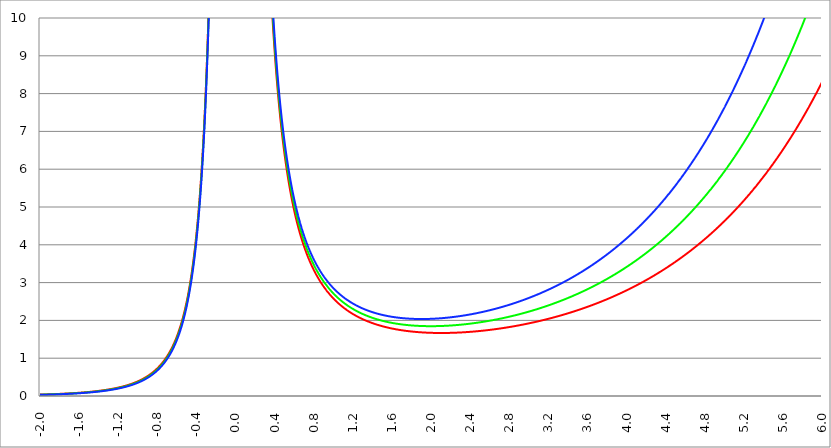
| Category | Series 1 | Series 0 | Series 2 |
|---|---|---|---|
| -2.0 | 0.037 | 0.034 | 0.031 |
| -1.996 | 0.038 | 0.034 | 0.031 |
| -1.992 | 0.038 | 0.034 | 0.031 |
| -1.988 | 0.038 | 0.035 | 0.031 |
| -1.984 | 0.039 | 0.035 | 0.032 |
| -1.98 | 0.039 | 0.035 | 0.032 |
| -1.976 | 0.039 | 0.036 | 0.032 |
| -1.972 | 0.039 | 0.036 | 0.032 |
| -1.968 | 0.04 | 0.036 | 0.033 |
| -1.964 | 0.04 | 0.036 | 0.033 |
| -1.96 | 0.04 | 0.037 | 0.033 |
| -1.956 | 0.041 | 0.037 | 0.034 |
| -1.952 | 0.041 | 0.037 | 0.034 |
| -1.948 | 0.041 | 0.038 | 0.034 |
| -1.944 | 0.042 | 0.038 | 0.034 |
| -1.94 | 0.042 | 0.038 | 0.035 |
| -1.936 | 0.042 | 0.038 | 0.035 |
| -1.932 | 0.043 | 0.039 | 0.035 |
| -1.928 | 0.043 | 0.039 | 0.036 |
| -1.924 | 0.043 | 0.039 | 0.036 |
| -1.92 | 0.044 | 0.04 | 0.036 |
| -1.916 | 0.044 | 0.04 | 0.036 |
| -1.912 | 0.044 | 0.04 | 0.037 |
| -1.908 | 0.045 | 0.041 | 0.037 |
| -1.904 | 0.045 | 0.041 | 0.037 |
| -1.9 | 0.046 | 0.041 | 0.038 |
| -1.896 | 0.046 | 0.042 | 0.038 |
| -1.892 | 0.046 | 0.042 | 0.038 |
| -1.888 | 0.047 | 0.042 | 0.039 |
| -1.884 | 0.047 | 0.043 | 0.039 |
| -1.88 | 0.047 | 0.043 | 0.039 |
| -1.876 | 0.048 | 0.044 | 0.04 |
| -1.872 | 0.048 | 0.044 | 0.04 |
| -1.868 | 0.049 | 0.044 | 0.04 |
| -1.864 | 0.049 | 0.045 | 0.041 |
| -1.86 | 0.049 | 0.045 | 0.041 |
| -1.856 | 0.05 | 0.045 | 0.041 |
| -1.852 | 0.05 | 0.046 | 0.042 |
| -1.848 | 0.051 | 0.046 | 0.042 |
| -1.844 | 0.051 | 0.047 | 0.042 |
| -1.84 | 0.051 | 0.047 | 0.043 |
| -1.836 | 0.052 | 0.047 | 0.043 |
| -1.832 | 0.052 | 0.048 | 0.044 |
| -1.828 | 0.053 | 0.048 | 0.044 |
| -1.824 | 0.053 | 0.049 | 0.044 |
| -1.82 | 0.054 | 0.049 | 0.045 |
| -1.816 | 0.054 | 0.049 | 0.045 |
| -1.812 | 0.054 | 0.05 | 0.045 |
| -1.808 | 0.055 | 0.05 | 0.046 |
| -1.804 | 0.055 | 0.051 | 0.046 |
| -1.8 | 0.056 | 0.051 | 0.047 |
| -1.796 | 0.056 | 0.051 | 0.047 |
| -1.792 | 0.057 | 0.052 | 0.047 |
| -1.788 | 0.057 | 0.052 | 0.048 |
| -1.784 | 0.058 | 0.053 | 0.048 |
| -1.78 | 0.058 | 0.053 | 0.049 |
| -1.776 | 0.059 | 0.054 | 0.049 |
| -1.772 | 0.059 | 0.054 | 0.05 |
| -1.768 | 0.06 | 0.055 | 0.05 |
| -1.764 | 0.06 | 0.055 | 0.05 |
| -1.76 | 0.061 | 0.056 | 0.051 |
| -1.756 | 0.061 | 0.056 | 0.051 |
| -1.752 | 0.062 | 0.056 | 0.052 |
| -1.748 | 0.062 | 0.057 | 0.052 |
| -1.744 | 0.063 | 0.057 | 0.053 |
| -1.74 | 0.063 | 0.058 | 0.053 |
| -1.736 | 0.064 | 0.058 | 0.054 |
| -1.732 | 0.064 | 0.059 | 0.054 |
| -1.728 | 0.065 | 0.059 | 0.055 |
| -1.724 | 0.065 | 0.06 | 0.055 |
| -1.72 | 0.066 | 0.061 | 0.056 |
| -1.716 | 0.067 | 0.061 | 0.056 |
| -1.712 | 0.067 | 0.062 | 0.057 |
| -1.708 | 0.068 | 0.062 | 0.057 |
| -1.704 | 0.068 | 0.063 | 0.058 |
| -1.7 | 0.069 | 0.063 | 0.058 |
| -1.696 | 0.069 | 0.064 | 0.059 |
| -1.692 | 0.07 | 0.064 | 0.059 |
| -1.688 | 0.071 | 0.065 | 0.06 |
| -1.684 | 0.071 | 0.065 | 0.06 |
| -1.68 | 0.072 | 0.066 | 0.061 |
| -1.676 | 0.072 | 0.067 | 0.061 |
| -1.672 | 0.073 | 0.067 | 0.062 |
| -1.668 | 0.074 | 0.068 | 0.062 |
| -1.664 | 0.074 | 0.068 | 0.063 |
| -1.66 | 0.075 | 0.069 | 0.064 |
| -1.656 | 0.076 | 0.07 | 0.064 |
| -1.652 | 0.076 | 0.07 | 0.065 |
| -1.648 | 0.077 | 0.071 | 0.065 |
| -1.644 | 0.078 | 0.071 | 0.066 |
| -1.64 | 0.078 | 0.072 | 0.066 |
| -1.636 | 0.079 | 0.073 | 0.067 |
| -1.632 | 0.08 | 0.073 | 0.068 |
| -1.628 | 0.08 | 0.074 | 0.068 |
| -1.624 | 0.081 | 0.075 | 0.069 |
| -1.62 | 0.082 | 0.075 | 0.07 |
| -1.616 | 0.082 | 0.076 | 0.07 |
| -1.612 | 0.083 | 0.077 | 0.071 |
| -1.608 | 0.084 | 0.077 | 0.071 |
| -1.604 | 0.085 | 0.078 | 0.072 |
| -1.6 | 0.085 | 0.079 | 0.073 |
| -1.596 | 0.086 | 0.08 | 0.073 |
| -1.592 | 0.087 | 0.08 | 0.074 |
| -1.588 | 0.088 | 0.081 | 0.075 |
| -1.584 | 0.089 | 0.082 | 0.076 |
| -1.58 | 0.089 | 0.083 | 0.076 |
| -1.576 | 0.09 | 0.083 | 0.077 |
| -1.572 | 0.091 | 0.084 | 0.078 |
| -1.568 | 0.092 | 0.085 | 0.078 |
| -1.564 | 0.093 | 0.086 | 0.079 |
| -1.56 | 0.093 | 0.086 | 0.08 |
| -1.556 | 0.094 | 0.087 | 0.081 |
| -1.552 | 0.095 | 0.088 | 0.081 |
| -1.548 | 0.096 | 0.089 | 0.082 |
| -1.544 | 0.097 | 0.09 | 0.083 |
| -1.54 | 0.098 | 0.09 | 0.084 |
| -1.536 | 0.099 | 0.091 | 0.084 |
| -1.532 | 0.099 | 0.092 | 0.085 |
| -1.528 | 0.1 | 0.093 | 0.086 |
| -1.524 | 0.101 | 0.094 | 0.087 |
| -1.52 | 0.102 | 0.095 | 0.088 |
| -1.516 | 0.103 | 0.096 | 0.089 |
| -1.512 | 0.104 | 0.096 | 0.089 |
| -1.508 | 0.105 | 0.097 | 0.09 |
| -1.504 | 0.106 | 0.098 | 0.091 |
| -1.5 | 0.107 | 0.099 | 0.092 |
| -1.496 | 0.108 | 0.1 | 0.093 |
| -1.492 | 0.109 | 0.101 | 0.094 |
| -1.488 | 0.11 | 0.102 | 0.095 |
| -1.484 | 0.111 | 0.103 | 0.096 |
| -1.48 | 0.112 | 0.104 | 0.097 |
| -1.476 | 0.113 | 0.105 | 0.097 |
| -1.472 | 0.114 | 0.106 | 0.098 |
| -1.467999999999999 | 0.115 | 0.107 | 0.099 |
| -1.463999999999999 | 0.116 | 0.108 | 0.1 |
| -1.459999999999999 | 0.117 | 0.109 | 0.101 |
| -1.455999999999999 | 0.118 | 0.11 | 0.102 |
| -1.451999999999999 | 0.119 | 0.111 | 0.103 |
| -1.447999999999999 | 0.121 | 0.112 | 0.104 |
| -1.443999999999999 | 0.122 | 0.113 | 0.105 |
| -1.439999999999999 | 0.123 | 0.114 | 0.106 |
| -1.435999999999999 | 0.124 | 0.115 | 0.107 |
| -1.431999999999999 | 0.125 | 0.116 | 0.108 |
| -1.427999999999999 | 0.126 | 0.118 | 0.109 |
| -1.423999999999999 | 0.127 | 0.119 | 0.111 |
| -1.419999999999999 | 0.129 | 0.12 | 0.112 |
| -1.415999999999999 | 0.13 | 0.121 | 0.113 |
| -1.411999999999999 | 0.131 | 0.122 | 0.114 |
| -1.407999999999999 | 0.132 | 0.123 | 0.115 |
| -1.403999999999999 | 0.134 | 0.125 | 0.116 |
| -1.399999999999999 | 0.135 | 0.126 | 0.117 |
| -1.395999999999999 | 0.136 | 0.127 | 0.118 |
| -1.391999999999999 | 0.138 | 0.128 | 0.12 |
| -1.387999999999999 | 0.139 | 0.13 | 0.121 |
| -1.383999999999999 | 0.14 | 0.131 | 0.122 |
| -1.379999999999999 | 0.142 | 0.132 | 0.123 |
| -1.375999999999999 | 0.143 | 0.133 | 0.125 |
| -1.371999999999999 | 0.144 | 0.135 | 0.126 |
| -1.367999999999999 | 0.146 | 0.136 | 0.127 |
| -1.363999999999999 | 0.147 | 0.137 | 0.128 |
| -1.359999999999999 | 0.149 | 0.139 | 0.13 |
| -1.355999999999999 | 0.15 | 0.14 | 0.131 |
| -1.351999999999999 | 0.151 | 0.142 | 0.132 |
| -1.347999999999999 | 0.153 | 0.143 | 0.134 |
| -1.343999999999999 | 0.154 | 0.144 | 0.135 |
| -1.339999999999999 | 0.156 | 0.146 | 0.136 |
| -1.335999999999999 | 0.157 | 0.147 | 0.138 |
| -1.331999999999999 | 0.159 | 0.149 | 0.139 |
| -1.327999999999999 | 0.161 | 0.15 | 0.141 |
| -1.323999999999999 | 0.162 | 0.152 | 0.142 |
| -1.319999999999999 | 0.164 | 0.153 | 0.144 |
| -1.315999999999999 | 0.165 | 0.155 | 0.145 |
| -1.311999999999999 | 0.167 | 0.156 | 0.147 |
| -1.307999999999999 | 0.169 | 0.158 | 0.148 |
| -1.303999999999999 | 0.17 | 0.16 | 0.15 |
| -1.299999999999999 | 0.172 | 0.161 | 0.151 |
| -1.295999999999999 | 0.174 | 0.163 | 0.153 |
| -1.291999999999999 | 0.176 | 0.165 | 0.154 |
| -1.287999999999999 | 0.177 | 0.166 | 0.156 |
| -1.283999999999999 | 0.179 | 0.168 | 0.158 |
| -1.279999999999999 | 0.181 | 0.17 | 0.159 |
| -1.275999999999999 | 0.183 | 0.171 | 0.161 |
| -1.271999999999999 | 0.185 | 0.173 | 0.163 |
| -1.267999999999999 | 0.186 | 0.175 | 0.164 |
| -1.263999999999999 | 0.188 | 0.177 | 0.166 |
| -1.259999999999999 | 0.19 | 0.179 | 0.168 |
| -1.255999999999999 | 0.192 | 0.181 | 0.17 |
| -1.251999999999999 | 0.194 | 0.182 | 0.171 |
| -1.247999999999999 | 0.196 | 0.184 | 0.173 |
| -1.243999999999999 | 0.198 | 0.186 | 0.175 |
| -1.239999999999999 | 0.2 | 0.188 | 0.177 |
| -1.235999999999999 | 0.202 | 0.19 | 0.179 |
| -1.231999999999999 | 0.204 | 0.192 | 0.181 |
| -1.227999999999999 | 0.207 | 0.194 | 0.183 |
| -1.223999999999999 | 0.209 | 0.196 | 0.185 |
| -1.219999999999999 | 0.211 | 0.198 | 0.187 |
| -1.215999999999999 | 0.213 | 0.2 | 0.189 |
| -1.211999999999999 | 0.215 | 0.203 | 0.191 |
| -1.207999999999999 | 0.218 | 0.205 | 0.193 |
| -1.203999999999999 | 0.22 | 0.207 | 0.195 |
| -1.199999999999999 | 0.222 | 0.209 | 0.197 |
| -1.195999999999999 | 0.224 | 0.211 | 0.199 |
| -1.191999999999999 | 0.227 | 0.214 | 0.201 |
| -1.187999999999999 | 0.229 | 0.216 | 0.204 |
| -1.183999999999999 | 0.232 | 0.218 | 0.206 |
| -1.179999999999999 | 0.234 | 0.221 | 0.208 |
| -1.175999999999999 | 0.237 | 0.223 | 0.21 |
| -1.171999999999999 | 0.239 | 0.226 | 0.213 |
| -1.167999999999999 | 0.242 | 0.228 | 0.215 |
| -1.163999999999999 | 0.244 | 0.23 | 0.217 |
| -1.159999999999999 | 0.247 | 0.233 | 0.22 |
| -1.155999999999999 | 0.25 | 0.236 | 0.222 |
| -1.151999999999999 | 0.252 | 0.238 | 0.225 |
| -1.147999999999999 | 0.255 | 0.241 | 0.227 |
| -1.143999999999999 | 0.258 | 0.243 | 0.23 |
| -1.139999999999999 | 0.261 | 0.246 | 0.232 |
| -1.135999999999999 | 0.263 | 0.249 | 0.235 |
| -1.131999999999999 | 0.266 | 0.252 | 0.238 |
| -1.127999999999999 | 0.269 | 0.254 | 0.24 |
| -1.123999999999999 | 0.272 | 0.257 | 0.243 |
| -1.119999999999999 | 0.275 | 0.26 | 0.246 |
| -1.115999999999999 | 0.278 | 0.263 | 0.249 |
| -1.111999999999999 | 0.281 | 0.266 | 0.252 |
| -1.107999999999999 | 0.284 | 0.269 | 0.254 |
| -1.103999999999999 | 0.287 | 0.272 | 0.257 |
| -1.099999999999999 | 0.291 | 0.275 | 0.26 |
| -1.095999999999999 | 0.294 | 0.278 | 0.263 |
| -1.091999999999999 | 0.297 | 0.281 | 0.266 |
| -1.087999999999999 | 0.301 | 0.285 | 0.27 |
| -1.083999999999999 | 0.304 | 0.288 | 0.273 |
| -1.079999999999999 | 0.307 | 0.291 | 0.276 |
| -1.075999999999999 | 0.311 | 0.294 | 0.279 |
| -1.071999999999999 | 0.314 | 0.298 | 0.282 |
| -1.067999999999999 | 0.318 | 0.301 | 0.286 |
| -1.063999999999999 | 0.321 | 0.305 | 0.289 |
| -1.059999999999999 | 0.325 | 0.308 | 0.292 |
| -1.055999999999999 | 0.329 | 0.312 | 0.296 |
| -1.051999999999999 | 0.333 | 0.316 | 0.299 |
| -1.047999999999999 | 0.336 | 0.319 | 0.303 |
| -1.043999999999999 | 0.34 | 0.323 | 0.307 |
| -1.039999999999999 | 0.344 | 0.327 | 0.31 |
| -1.035999999999999 | 0.348 | 0.331 | 0.314 |
| -1.031999999999999 | 0.352 | 0.335 | 0.318 |
| -1.027999999999999 | 0.356 | 0.339 | 0.322 |
| -1.023999999999999 | 0.361 | 0.343 | 0.325 |
| -1.019999999999999 | 0.365 | 0.347 | 0.329 |
| -1.015999999999999 | 0.369 | 0.351 | 0.333 |
| -1.011999999999999 | 0.373 | 0.355 | 0.337 |
| -1.007999999999999 | 0.378 | 0.359 | 0.342 |
| -1.003999999999999 | 0.382 | 0.363 | 0.346 |
| -0.999999999999999 | 0.387 | 0.368 | 0.35 |
| -0.995999999999999 | 0.391 | 0.372 | 0.354 |
| -0.991999999999999 | 0.396 | 0.377 | 0.359 |
| -0.987999999999999 | 0.401 | 0.381 | 0.363 |
| -0.983999999999999 | 0.406 | 0.386 | 0.368 |
| -0.979999999999999 | 0.41 | 0.391 | 0.372 |
| -0.975999999999999 | 0.415 | 0.396 | 0.377 |
| -0.971999999999999 | 0.42 | 0.4 | 0.381 |
| -0.967999999999999 | 0.425 | 0.405 | 0.386 |
| -0.963999999999999 | 0.431 | 0.41 | 0.391 |
| -0.959999999999999 | 0.436 | 0.415 | 0.396 |
| -0.955999999999999 | 0.441 | 0.421 | 0.401 |
| -0.951999999999999 | 0.447 | 0.426 | 0.406 |
| -0.947999999999999 | 0.452 | 0.431 | 0.411 |
| -0.943999999999999 | 0.458 | 0.437 | 0.416 |
| -0.939999999999999 | 0.463 | 0.442 | 0.422 |
| -0.935999999999999 | 0.469 | 0.448 | 0.427 |
| -0.931999999999999 | 0.475 | 0.453 | 0.433 |
| -0.927999999999999 | 0.481 | 0.459 | 0.438 |
| -0.923999999999999 | 0.487 | 0.465 | 0.444 |
| -0.919999999999999 | 0.493 | 0.471 | 0.45 |
| -0.915999999999999 | 0.499 | 0.477 | 0.456 |
| -0.911999999999999 | 0.506 | 0.483 | 0.461 |
| -0.907999999999999 | 0.512 | 0.489 | 0.467 |
| -0.903999999999999 | 0.518 | 0.496 | 0.474 |
| -0.899999999999999 | 0.525 | 0.502 | 0.48 |
| -0.895999999999999 | 0.532 | 0.508 | 0.486 |
| -0.891999999999999 | 0.539 | 0.515 | 0.493 |
| -0.887999999999999 | 0.546 | 0.522 | 0.499 |
| -0.883999999999999 | 0.553 | 0.529 | 0.506 |
| -0.879999999999999 | 0.56 | 0.536 | 0.513 |
| -0.875999999999999 | 0.567 | 0.543 | 0.519 |
| -0.871999999999999 | 0.574 | 0.55 | 0.526 |
| -0.867999999999999 | 0.582 | 0.557 | 0.534 |
| -0.863999999999999 | 0.59 | 0.565 | 0.541 |
| -0.859999999999999 | 0.597 | 0.572 | 0.548 |
| -0.855999999999999 | 0.605 | 0.58 | 0.556 |
| -0.851999999999999 | 0.613 | 0.588 | 0.563 |
| -0.847999999999999 | 0.621 | 0.596 | 0.571 |
| -0.843999999999999 | 0.63 | 0.604 | 0.579 |
| -0.839999999999999 | 0.638 | 0.612 | 0.587 |
| -0.835999999999999 | 0.647 | 0.62 | 0.595 |
| -0.831999999999999 | 0.655 | 0.629 | 0.603 |
| -0.827999999999999 | 0.664 | 0.637 | 0.611 |
| -0.823999999999999 | 0.673 | 0.646 | 0.62 |
| -0.819999999999999 | 0.682 | 0.655 | 0.629 |
| -0.815999999999999 | 0.692 | 0.664 | 0.638 |
| -0.811999999999999 | 0.701 | 0.673 | 0.647 |
| -0.807999999999999 | 0.711 | 0.683 | 0.656 |
| -0.803999999999999 | 0.721 | 0.692 | 0.665 |
| -0.799999999999999 | 0.731 | 0.702 | 0.675 |
| -0.795999999999999 | 0.741 | 0.712 | 0.684 |
| -0.791999999999999 | 0.751 | 0.722 | 0.694 |
| -0.787999999999999 | 0.762 | 0.732 | 0.704 |
| -0.783999999999999 | 0.773 | 0.743 | 0.714 |
| -0.779999999999999 | 0.783 | 0.753 | 0.725 |
| -0.775999999999999 | 0.795 | 0.764 | 0.735 |
| -0.771999999999999 | 0.806 | 0.775 | 0.746 |
| -0.767999999999999 | 0.817 | 0.787 | 0.757 |
| -0.763999999999999 | 0.829 | 0.798 | 0.768 |
| -0.759999999999999 | 0.841 | 0.81 | 0.779 |
| -0.755999999999999 | 0.853 | 0.822 | 0.791 |
| -0.751999999999999 | 0.866 | 0.834 | 0.803 |
| -0.747999999999999 | 0.878 | 0.846 | 0.815 |
| -0.743999999999999 | 0.891 | 0.858 | 0.827 |
| -0.739999999999999 | 0.904 | 0.871 | 0.84 |
| -0.735999999999999 | 0.917 | 0.884 | 0.852 |
| -0.731999999999999 | 0.931 | 0.898 | 0.865 |
| -0.727999999999999 | 0.945 | 0.911 | 0.879 |
| -0.723999999999999 | 0.959 | 0.925 | 0.892 |
| -0.719999999999999 | 0.973 | 0.939 | 0.906 |
| -0.715999999999999 | 0.988 | 0.953 | 0.92 |
| -0.711999999999999 | 1.003 | 0.968 | 0.934 |
| -0.707999999999999 | 1.018 | 0.983 | 0.949 |
| -0.703999999999999 | 1.034 | 0.998 | 0.963 |
| -0.699999999999999 | 1.05 | 1.013 | 0.979 |
| -0.695999999999999 | 1.066 | 1.029 | 0.994 |
| -0.691999999999999 | 1.082 | 1.045 | 1.01 |
| -0.687999999999999 | 1.099 | 1.062 | 1.026 |
| -0.683999999999999 | 1.116 | 1.079 | 1.042 |
| -0.679999999999999 | 1.134 | 1.096 | 1.059 |
| -0.675999999999999 | 1.151 | 1.113 | 1.076 |
| -0.671999999999999 | 1.17 | 1.131 | 1.094 |
| -0.667999999999999 | 1.188 | 1.149 | 1.111 |
| -0.663999999999999 | 1.207 | 1.168 | 1.129 |
| -0.659999999999999 | 1.226 | 1.187 | 1.148 |
| -0.655999999999999 | 1.246 | 1.206 | 1.167 |
| -0.651999999999999 | 1.266 | 1.226 | 1.186 |
| -0.647999999999999 | 1.287 | 1.246 | 1.206 |
| -0.643999999999999 | 1.308 | 1.266 | 1.226 |
| -0.639999999999999 | 1.329 | 1.287 | 1.247 |
| -0.635999999999999 | 1.351 | 1.309 | 1.268 |
| -0.631999999999999 | 1.373 | 1.331 | 1.289 |
| -0.627999999999999 | 1.396 | 1.353 | 1.311 |
| -0.623999999999999 | 1.42 | 1.376 | 1.334 |
| -0.619999999999999 | 1.444 | 1.399 | 1.357 |
| -0.615999999999999 | 1.468 | 1.423 | 1.38 |
| -0.611999999999999 | 1.493 | 1.448 | 1.404 |
| -0.607999999999999 | 1.518 | 1.473 | 1.429 |
| -0.603999999999999 | 1.544 | 1.498 | 1.454 |
| -0.599999999999999 | 1.571 | 1.524 | 1.479 |
| -0.595999999999999 | 1.598 | 1.551 | 1.506 |
| -0.591999999999999 | 1.626 | 1.579 | 1.532 |
| -0.587999999999999 | 1.654 | 1.606 | 1.56 |
| -0.583999999999999 | 1.684 | 1.635 | 1.588 |
| -0.579999999999999 | 1.713 | 1.664 | 1.617 |
| -0.575999999999999 | 1.744 | 1.694 | 1.646 |
| -0.571999999999999 | 1.775 | 1.725 | 1.676 |
| -0.567999999999999 | 1.807 | 1.756 | 1.707 |
| -0.563999999999999 | 1.84 | 1.789 | 1.739 |
| -0.559999999999999 | 1.873 | 1.821 | 1.771 |
| -0.555999999999999 | 1.907 | 1.855 | 1.804 |
| -0.551999999999999 | 1.943 | 1.89 | 1.838 |
| -0.547999999999999 | 1.979 | 1.925 | 1.873 |
| -0.543999999999999 | 2.015 | 1.961 | 1.909 |
| -0.539999999999999 | 2.053 | 1.998 | 1.945 |
| -0.535999999999999 | 2.092 | 2.037 | 1.983 |
| -0.531999999999999 | 2.131 | 2.076 | 2.021 |
| -0.527999999999999 | 2.172 | 2.116 | 2.06 |
| -0.523999999999999 | 2.214 | 2.157 | 2.101 |
| -0.519999999999999 | 2.257 | 2.199 | 2.142 |
| -0.515999999999999 | 2.3 | 2.242 | 2.185 |
| -0.511999999999999 | 2.345 | 2.286 | 2.228 |
| -0.507999999999999 | 2.392 | 2.332 | 2.273 |
| -0.503999999999999 | 2.439 | 2.378 | 2.319 |
| -0.499999999999999 | 2.488 | 2.426 | 2.366 |
| -0.495999999999999 | 2.537 | 2.475 | 2.415 |
| -0.491999999999999 | 2.589 | 2.526 | 2.464 |
| -0.487999999999999 | 2.641 | 2.578 | 2.516 |
| -0.483999999999999 | 2.695 | 2.631 | 2.568 |
| -0.479999999999999 | 2.751 | 2.686 | 2.622 |
| -0.475999999999999 | 2.808 | 2.742 | 2.677 |
| -0.471999999999999 | 2.867 | 2.8 | 2.735 |
| -0.467999999999999 | 2.927 | 2.859 | 2.793 |
| -0.463999999999999 | 2.989 | 2.92 | 2.853 |
| -0.459999999999999 | 3.053 | 2.983 | 2.916 |
| -0.455999999999999 | 3.118 | 3.048 | 2.979 |
| -0.451999999999999 | 3.186 | 3.115 | 3.045 |
| -0.447999999999999 | 3.255 | 3.183 | 3.113 |
| -0.443999999999999 | 3.327 | 3.254 | 3.182 |
| -0.439999999999999 | 3.401 | 3.327 | 3.254 |
| -0.435999999999999 | 3.477 | 3.402 | 3.328 |
| -0.431999999999999 | 3.555 | 3.479 | 3.404 |
| -0.427999999999999 | 3.635 | 3.558 | 3.483 |
| -0.423999999999999 | 3.718 | 3.64 | 3.564 |
| -0.419999999999999 | 3.804 | 3.725 | 3.647 |
| -0.415999999999999 | 3.892 | 3.812 | 3.733 |
| -0.411999999999999 | 3.983 | 3.902 | 3.822 |
| -0.407999999999999 | 4.077 | 3.995 | 3.914 |
| -0.403999999999999 | 4.174 | 4.091 | 4.009 |
| -0.399999999999999 | 4.274 | 4.19 | 4.107 |
| -0.395999999999999 | 4.378 | 4.292 | 4.208 |
| -0.391999999999999 | 4.484 | 4.397 | 4.312 |
| -0.387999999999999 | 4.595 | 4.506 | 4.42 |
| -0.383999999999999 | 4.709 | 4.619 | 4.531 |
| -0.379999999999999 | 4.827 | 4.736 | 4.647 |
| -0.375999999999999 | 4.949 | 4.857 | 4.766 |
| -0.371999999999999 | 5.075 | 4.981 | 4.89 |
| -0.367999999999998 | 5.206 | 5.111 | 5.018 |
| -0.363999999999998 | 5.341 | 5.245 | 5.15 |
| -0.359999999999998 | 5.481 | 5.383 | 5.287 |
| -0.355999999999998 | 5.626 | 5.527 | 5.43 |
| -0.351999999999998 | 5.777 | 5.676 | 5.577 |
| -0.347999999999998 | 5.933 | 5.831 | 5.73 |
| -0.343999999999998 | 6.095 | 5.991 | 5.889 |
| -0.339999999999998 | 6.263 | 6.157 | 6.053 |
| -0.335999999999998 | 6.437 | 6.33 | 6.224 |
| -0.331999999999998 | 6.618 | 6.509 | 6.402 |
| -0.327999999999998 | 6.807 | 6.696 | 6.587 |
| -0.323999999999998 | 7.002 | 6.89 | 6.779 |
| -0.319999999999998 | 7.206 | 7.091 | 6.979 |
| -0.315999999999998 | 7.417 | 7.301 | 7.187 |
| -0.311999999999998 | 7.638 | 7.52 | 7.403 |
| -0.307999999999998 | 7.867 | 7.747 | 7.629 |
| -0.303999999999998 | 8.106 | 7.984 | 7.864 |
| -0.299999999999998 | 8.356 | 8.231 | 8.109 |
| -0.295999999999998 | 8.616 | 8.489 | 8.364 |
| -0.291999999999998 | 8.887 | 8.758 | 8.631 |
| -0.287999999999998 | 9.17 | 9.039 | 8.91 |
| -0.283999999999998 | 9.467 | 9.333 | 9.201 |
| -0.279999999999998 | 9.776 | 9.64 | 9.506 |
| -0.275999999999998 | 10.1 | 9.961 | 9.825 |
| -0.271999999999998 | 10.439 | 10.298 | 10.158 |
| -0.267999999999998 | 10.793 | 10.65 | 10.508 |
| -0.263999999999998 | 11.165 | 11.019 | 10.874 |
| -0.259999999999998 | 11.555 | 11.406 | 11.259 |
| -0.255999999999998 | 11.965 | 11.812 | 11.662 |
| -0.251999999999998 | 12.394 | 12.239 | 12.086 |
| -0.247999999999998 | 12.846 | 12.688 | 12.532 |
| -0.243999999999998 | 13.321 | 13.16 | 13 |
| -0.239999999999998 | 13.822 | 13.657 | 13.494 |
| -0.235999999999998 | 14.349 | 14.18 | 14.014 |
| -0.231999999999998 | 14.904 | 14.732 | 14.562 |
| -0.227999999999998 | 15.49 | 15.315 | 15.141 |
| -0.223999999999998 | 16.11 | 15.93 | 15.753 |
| -0.219999999999998 | 16.764 | 16.581 | 16.4 |
| -0.215999999999998 | 17.457 | 17.27 | 17.084 |
| -0.211999999999998 | 18.191 | 17.999 | 17.81 |
| -0.207999999999998 | 18.97 | 18.773 | 18.579 |
| -0.203999999999998 | 19.796 | 19.595 | 19.396 |
| -0.199999999999998 | 20.674 | 20.468 | 20.265 |
| -0.195999999999998 | 21.608 | 21.398 | 21.189 |
| -0.191999999999998 | 22.604 | 22.388 | 22.174 |
| -0.187999999999998 | 23.666 | 23.444 | 23.225 |
| -0.183999999999998 | 24.8 | 24.573 | 24.348 |
| -0.179999999999998 | 26.013 | 25.78 | 25.549 |
| -0.175999999999998 | 27.312 | 27.073 | 26.836 |
| -0.171999999999998 | 28.706 | 28.461 | 28.217 |
| -0.167999999999998 | 30.204 | 29.952 | 29.701 |
| -0.163999999999998 | 31.816 | 31.556 | 31.299 |
| -0.159999999999998 | 33.554 | 33.287 | 33.022 |
| -0.155999999999998 | 35.431 | 35.156 | 34.883 |
| -0.151999999999998 | 37.463 | 37.179 | 36.898 |
| -0.147999999999998 | 39.666 | 39.373 | 39.083 |
| -0.143999999999998 | 42.059 | 41.758 | 41.458 |
| -0.139999999999998 | 44.667 | 44.355 | 44.046 |
| -0.135999999999998 | 47.513 | 47.191 | 46.871 |
| -0.131999999999998 | 50.628 | 50.295 | 49.964 |
| -0.127999999999998 | 54.047 | 53.702 | 53.359 |
| -0.123999999999998 | 57.809 | 57.452 | 57.097 |
| -0.119999999999998 | 61.962 | 61.592 | 61.223 |
| -0.115999999999998 | 66.562 | 66.177 | 65.794 |
| -0.111999999999998 | 71.673 | 71.273 | 70.875 |
| -0.107999999999998 | 77.374 | 76.957 | 76.543 |
| -0.103999999999998 | 83.758 | 83.323 | 82.891 |
| -0.0999999999999983 | 90.937 | 90.484 | 90.032 |
| -0.0959999999999983 | 99.049 | 98.575 | 98.103 |
| -0.0919999999999983 | 108.26 | 107.763 | 107.268 |
| -0.0879999999999983 | 118.776 | 118.254 | 117.735 |
| -0.0839999999999983 | 130.853 | 130.305 | 129.759 |
| -0.0799999999999983 | 144.815 | 144.237 | 143.661 |
| -0.0759999999999983 | 161.071 | 160.46 | 159.851 |
| -0.0719999999999983 | 180.148 | 179.501 | 178.856 |
| -0.0679999999999983 | 202.734 | 202.046 | 201.36 |
| -0.0639999999999983 | 229.739 | 229.005 | 228.273 |
| -0.0599999999999983 | 262.387 | 261.601 | 260.818 |
| -0.0559999999999983 | 302.357 | 301.511 | 300.668 |
| -0.0519999999999983 | 351.997 | 351.083 | 350.172 |
| -0.0479999999999983 | 414.681 | 413.687 | 412.695 |
| -0.0439999999999983 | 495.383 | 494.294 | 493.208 |
| -0.0399999999999983 | 601.696 | 600.493 | 599.294 |
| -0.0359999999999982 | 745.662 | 744.321 | 742.983 |
| -0.0319999999999982 | 947.322 | 945.807 | 944.295 |
| -0.0279999999999982 | 1242.029 | 1240.291 | 1238.556 |
| -0.0239999999999982 | 1696.976 | 1694.94 | 1692.908 |
| -0.0199999999999982 | 2452.948 | 2450.497 | 2448.047 |
| -0.0159999999999982 | 3847.324 | 3844.247 | 3841.173 |
| -0.0119999999999982 | 6865.727 | 6861.609 | 6857.493 |
| -0.00799999999999825 | 15506.7 | 15500.499 | 15494.3 |
| -0.00399999999999825 | 62262.951 | 62250.499 | 62238.05 |
| 1.74860126378462e-15 | 327053216083070977659786756096 | 327053216083070977659786756096 | 327053216083070977659786756096 |
| 0.00400000000000175 | 62737.952 | 62750.501 | 62763.052 |
| 0.00800000000000175 | 15744.202 | 15750.501 | 15756.803 |
| 0.0120000000000017 | 7024.064 | 7028.28 | 7032.498 |
| 0.0160000000000017 | 3966.079 | 3969.253 | 3972.429 |
| 0.0200000000000017 | 2547.954 | 2550.503 | 2553.055 |
| 0.0240000000000017 | 1776.149 | 1778.282 | 1780.417 |
| 0.0280000000000017 | 1309.894 | 1311.729 | 1313.567 |
| 0.0320000000000017 | 1006.706 | 1008.318 | 1009.932 |
| 0.0360000000000017 | 798.45 | 799.889 | 801.33 |
| 0.0400000000000017 | 649.207 | 650.507 | 651.809 |
| 0.0440000000000018 | 538.577 | 539.764 | 540.952 |
| 0.0480000000000018 | 454.278 | 455.369 | 456.463 |
| 0.0520000000000018 | 388.55 | 389.562 | 390.576 |
| 0.0560000000000018 | 336.301 | 337.244 | 338.19 |
| 0.0600000000000018 | 294.071 | 294.955 | 295.841 |
| 0.0640000000000018 | 259.445 | 260.276 | 261.111 |
| 0.0680000000000018 | 230.695 | 231.48 | 232.269 |
| 0.0720000000000018 | 206.557 | 207.302 | 208.05 |
| 0.0760000000000018 | 186.093 | 186.801 | 187.512 |
| 0.0800000000000018 | 168.588 | 169.264 | 169.942 |
| 0.0840000000000018 | 153.496 | 154.142 | 154.791 |
| 0.0880000000000018 | 140.392 | 141.011 | 141.633 |
| 0.0920000000000018 | 128.938 | 129.533 | 130.13 |
| 0.0960000000000018 | 118.868 | 119.44 | 120.015 |
| 0.100000000000002 | 109.966 | 110.517 | 111.071 |
| 0.104000000000002 | 102.057 | 102.589 | 103.124 |
| 0.108000000000002 | 94.997 | 95.512 | 96.029 |
| 0.112000000000002 | 88.669 | 89.167 | 89.668 |
| 0.116000000000002 | 82.974 | 83.457 | 83.942 |
| 0.120000000000002 | 77.83 | 78.298 | 78.77 |
| 0.124000000000002 | 73.167 | 73.622 | 74.08 |
| 0.128000000000002 | 68.927 | 69.37 | 69.815 |
| 0.132000000000002 | 65.06 | 65.491 | 65.924 |
| 0.136000000000002 | 61.522 | 61.942 | 62.365 |
| 0.140000000000002 | 58.278 | 58.687 | 59.1 |
| 0.144000000000002 | 55.295 | 55.695 | 56.097 |
| 0.148000000000002 | 52.546 | 52.936 | 53.329 |
| 0.152000000000002 | 50.006 | 50.388 | 50.772 |
| 0.156000000000002 | 47.656 | 48.029 | 48.405 |
| 0.160000000000002 | 45.475 | 45.84 | 46.208 |
| 0.164000000000002 | 43.449 | 43.806 | 44.167 |
| 0.168000000000002 | 41.562 | 41.912 | 42.266 |
| 0.172000000000002 | 39.802 | 40.146 | 40.493 |
| 0.176000000000002 | 38.158 | 38.496 | 38.836 |
| 0.180000000000002 | 36.62 | 36.951 | 37.285 |
| 0.184000000000002 | 35.179 | 35.504 | 35.832 |
| 0.188000000000002 | 33.826 | 34.145 | 34.468 |
| 0.192000000000002 | 32.555 | 32.869 | 33.186 |
| 0.196000000000002 | 31.358 | 31.667 | 31.979 |
| 0.200000000000002 | 30.231 | 30.535 | 30.842 |
| 0.204000000000002 | 29.168 | 29.467 | 29.769 |
| 0.208000000000002 | 28.164 | 28.458 | 28.756 |
| 0.212000000000002 | 27.214 | 27.504 | 27.797 |
| 0.216000000000002 | 26.315 | 26.601 | 26.89 |
| 0.220000000000002 | 25.464 | 25.745 | 26.03 |
| 0.224000000000002 | 24.656 | 24.934 | 25.214 |
| 0.228000000000002 | 23.889 | 24.163 | 24.44 |
| 0.232000000000002 | 23.16 | 23.43 | 23.704 |
| 0.236000000000002 | 22.467 | 22.734 | 23.004 |
| 0.240000000000002 | 21.807 | 22.07 | 22.337 |
| 0.244000000000002 | 21.178 | 21.438 | 21.701 |
| 0.248000000000002 | 20.579 | 20.835 | 21.095 |
| 0.252000000000002 | 20.006 | 20.26 | 20.517 |
| 0.256000000000002 | 19.46 | 19.711 | 19.964 |
| 0.260000000000002 | 18.938 | 19.185 | 19.436 |
| 0.264000000000002 | 18.438 | 18.683 | 18.931 |
| 0.268000000000002 | 17.96 | 18.202 | 18.448 |
| 0.272000000000002 | 17.502 | 17.741 | 17.984 |
| 0.276000000000002 | 17.063 | 17.3 | 17.54 |
| 0.280000000000002 | 16.642 | 16.877 | 17.115 |
| 0.284000000000002 | 16.238 | 16.47 | 16.706 |
| 0.288000000000002 | 15.85 | 16.08 | 16.313 |
| 0.292000000000002 | 15.478 | 15.705 | 15.936 |
| 0.296000000000002 | 15.12 | 15.345 | 15.574 |
| 0.300000000000002 | 14.775 | 14.998 | 15.225 |
| 0.304000000000002 | 14.444 | 14.665 | 14.889 |
| 0.308000000000002 | 14.125 | 14.344 | 14.566 |
| 0.312000000000002 | 13.817 | 14.034 | 14.255 |
| 0.316000000000002 | 13.521 | 13.736 | 13.955 |
| 0.320000000000002 | 13.235 | 13.449 | 13.665 |
| 0.324000000000002 | 12.959 | 13.171 | 13.386 |
| 0.328000000000002 | 12.693 | 12.903 | 13.117 |
| 0.332000000000002 | 12.437 | 12.645 | 12.856 |
| 0.336000000000002 | 12.188 | 12.395 | 12.605 |
| 0.340000000000002 | 11.949 | 12.154 | 12.362 |
| 0.344000000000002 | 11.717 | 11.92 | 12.127 |
| 0.348000000000002 | 11.493 | 11.694 | 11.9 |
| 0.352000000000002 | 11.276 | 11.476 | 11.68 |
| 0.356000000000002 | 11.066 | 11.264 | 11.467 |
| 0.360000000000002 | 10.862 | 11.06 | 11.261 |
| 0.364000000000002 | 10.665 | 10.861 | 11.061 |
| 0.368000000000002 | 10.475 | 10.669 | 10.867 |
| 0.372000000000002 | 10.289 | 10.483 | 10.679 |
| 0.376000000000002 | 10.11 | 10.302 | 10.497 |
| 0.380000000000002 | 9.936 | 10.127 | 10.321 |
| 0.384000000000002 | 9.767 | 9.956 | 10.15 |
| 0.388000000000002 | 9.603 | 9.791 | 9.983 |
| 0.392000000000002 | 9.444 | 9.631 | 9.822 |
| 0.396000000000002 | 9.289 | 9.475 | 9.665 |
| 0.400000000000002 | 9.139 | 9.324 | 9.512 |
| 0.404000000000002 | 8.993 | 9.177 | 9.364 |
| 0.408000000000002 | 8.851 | 9.034 | 9.22 |
| 0.412000000000002 | 8.713 | 8.895 | 9.08 |
| 0.416000000000002 | 8.579 | 8.76 | 8.944 |
| 0.420000000000002 | 8.449 | 8.628 | 8.811 |
| 0.424000000000002 | 8.322 | 8.5 | 8.682 |
| 0.428000000000002 | 8.198 | 8.375 | 8.556 |
| 0.432000000000002 | 8.077 | 8.254 | 8.434 |
| 0.436000000000002 | 7.96 | 8.135 | 8.315 |
| 0.440000000000002 | 7.846 | 8.02 | 8.199 |
| 0.444000000000002 | 7.734 | 7.908 | 8.085 |
| 0.448000000000002 | 7.626 | 7.798 | 7.975 |
| 0.452000000000002 | 7.52 | 7.692 | 7.868 |
| 0.456000000000002 | 7.417 | 7.588 | 7.763 |
| 0.460000000000002 | 7.316 | 7.486 | 7.66 |
| 0.464000000000002 | 7.218 | 7.387 | 7.561 |
| 0.468000000000002 | 7.122 | 7.291 | 7.463 |
| 0.472000000000002 | 7.028 | 7.196 | 7.368 |
| 0.476000000000002 | 6.937 | 7.104 | 7.275 |
| 0.480000000000002 | 6.848 | 7.014 | 7.185 |
| 0.484000000000002 | 6.761 | 6.926 | 7.096 |
| 0.488000000000002 | 6.676 | 6.841 | 7.01 |
| 0.492000000000002 | 6.593 | 6.757 | 6.925 |
| 0.496000000000002 | 6.511 | 6.675 | 6.843 |
| 0.500000000000002 | 6.432 | 6.595 | 6.762 |
| 0.504000000000002 | 6.354 | 6.517 | 6.683 |
| 0.508000000000002 | 6.279 | 6.44 | 6.606 |
| 0.512000000000002 | 6.204 | 6.365 | 6.53 |
| 0.516000000000002 | 6.132 | 6.292 | 6.457 |
| 0.520000000000002 | 6.061 | 6.221 | 6.384 |
| 0.524000000000002 | 5.991 | 6.15 | 6.314 |
| 0.528000000000002 | 5.923 | 6.082 | 6.245 |
| 0.532000000000002 | 5.857 | 6.015 | 6.177 |
| 0.536000000000002 | 5.792 | 5.949 | 6.111 |
| 0.540000000000002 | 5.728 | 5.885 | 6.046 |
| 0.544000000000002 | 5.666 | 5.822 | 5.982 |
| 0.548000000000002 | 5.604 | 5.76 | 5.92 |
| 0.552000000000002 | 5.545 | 5.7 | 5.859 |
| 0.556000000000002 | 5.486 | 5.641 | 5.8 |
| 0.560000000000002 | 5.428 | 5.583 | 5.741 |
| 0.564000000000002 | 5.372 | 5.526 | 5.684 |
| 0.568000000000002 | 5.317 | 5.47 | 5.628 |
| 0.572000000000002 | 5.263 | 5.415 | 5.572 |
| 0.576000000000002 | 5.21 | 5.362 | 5.518 |
| 0.580000000000002 | 5.158 | 5.309 | 5.465 |
| 0.584000000000002 | 5.106 | 5.258 | 5.414 |
| 0.588000000000002 | 5.056 | 5.207 | 5.363 |
| 0.592000000000002 | 5.007 | 5.158 | 5.313 |
| 0.596000000000002 | 4.959 | 5.109 | 5.264 |
| 0.600000000000002 | 4.912 | 5.061 | 5.216 |
| 0.604000000000002 | 4.865 | 5.015 | 5.168 |
| 0.608000000000002 | 4.82 | 4.969 | 5.122 |
| 0.612000000000002 | 4.775 | 4.924 | 5.077 |
| 0.616000000000002 | 4.731 | 4.879 | 5.032 |
| 0.620000000000002 | 4.688 | 4.836 | 4.988 |
| 0.624000000000002 | 4.646 | 4.793 | 4.945 |
| 0.628000000000002 | 4.604 | 4.751 | 4.903 |
| 0.632000000000002 | 4.564 | 4.71 | 4.861 |
| 0.636000000000002 | 4.524 | 4.67 | 4.821 |
| 0.640000000000002 | 4.484 | 4.63 | 4.781 |
| 0.644000000000002 | 4.446 | 4.591 | 4.741 |
| 0.648000000000002 | 4.408 | 4.553 | 4.703 |
| 0.652000000000002 | 4.37 | 4.515 | 4.665 |
| 0.656000000000002 | 4.334 | 4.478 | 4.627 |
| 0.660000000000002 | 4.297 | 4.442 | 4.591 |
| 0.664000000000002 | 4.262 | 4.406 | 4.555 |
| 0.668000000000002 | 4.227 | 4.371 | 4.519 |
| 0.672000000000002 | 4.193 | 4.336 | 4.484 |
| 0.676000000000002 | 4.159 | 4.302 | 4.45 |
| 0.680000000000002 | 4.126 | 4.269 | 4.416 |
| 0.684000000000002 | 4.093 | 4.236 | 4.383 |
| 0.688000000000002 | 4.061 | 4.204 | 4.351 |
| 0.692000000000002 | 4.03 | 4.172 | 4.319 |
| 0.696000000000002 | 3.999 | 4.14 | 4.287 |
| 0.700000000000002 | 3.968 | 4.11 | 4.256 |
| 0.704000000000002 | 3.938 | 4.079 | 4.226 |
| 0.708000000000002 | 3.909 | 4.05 | 4.196 |
| 0.712000000000002 | 3.88 | 4.02 | 4.166 |
| 0.716000000000002 | 3.851 | 3.991 | 4.137 |
| 0.720000000000002 | 3.823 | 3.963 | 4.108 |
| 0.724000000000002 | 3.795 | 3.935 | 4.08 |
| 0.728000000000002 | 3.768 | 3.908 | 4.052 |
| 0.732000000000002 | 3.741 | 3.88 | 4.025 |
| 0.736000000000002 | 3.715 | 3.854 | 3.998 |
| 0.740000000000002 | 3.688 | 3.827 | 3.972 |
| 0.744000000000002 | 3.663 | 3.802 | 3.946 |
| 0.748000000000002 | 3.638 | 3.776 | 3.92 |
| 0.752000000000002 | 3.613 | 3.751 | 3.895 |
| 0.756000000000002 | 3.588 | 3.726 | 3.87 |
| 0.760000000000002 | 3.564 | 3.702 | 3.845 |
| 0.764000000000002 | 3.54 | 3.678 | 3.821 |
| 0.768000000000002 | 3.517 | 3.654 | 3.797 |
| 0.772000000000002 | 3.494 | 3.631 | 3.774 |
| 0.776000000000002 | 3.471 | 3.608 | 3.751 |
| 0.780000000000002 | 3.448 | 3.586 | 3.728 |
| 0.784000000000002 | 3.426 | 3.563 | 3.706 |
| 0.788000000000002 | 3.405 | 3.541 | 3.684 |
| 0.792000000000002 | 3.383 | 3.52 | 3.662 |
| 0.796000000000002 | 3.362 | 3.498 | 3.64 |
| 0.800000000000002 | 3.341 | 3.477 | 3.619 |
| 0.804000000000002 | 3.32 | 3.457 | 3.598 |
| 0.808000000000002 | 3.3 | 3.436 | 3.578 |
| 0.812000000000002 | 3.28 | 3.416 | 3.558 |
| 0.816000000000002 | 3.261 | 3.396 | 3.538 |
| 0.820000000000002 | 3.241 | 3.377 | 3.518 |
| 0.824000000000002 | 3.222 | 3.357 | 3.499 |
| 0.828000000000002 | 3.203 | 3.338 | 3.479 |
| 0.832000000000002 | 3.184 | 3.32 | 3.461 |
| 0.836000000000002 | 3.166 | 3.301 | 3.442 |
| 0.840000000000002 | 3.148 | 3.283 | 3.424 |
| 0.844000000000002 | 3.13 | 3.265 | 3.406 |
| 0.848000000000002 | 3.112 | 3.247 | 3.388 |
| 0.852000000000002 | 3.095 | 3.23 | 3.37 |
| 0.856000000000002 | 3.078 | 3.212 | 3.353 |
| 0.860000000000002 | 3.061 | 3.195 | 3.336 |
| 0.864000000000002 | 3.044 | 3.178 | 3.319 |
| 0.868000000000002 | 3.027 | 3.162 | 3.302 |
| 0.872000000000002 | 3.011 | 3.145 | 3.286 |
| 0.876000000000002 | 2.995 | 3.129 | 3.269 |
| 0.880000000000002 | 2.979 | 3.113 | 3.253 |
| 0.884000000000002 | 2.964 | 3.098 | 3.237 |
| 0.888000000000002 | 2.948 | 3.082 | 3.222 |
| 0.892000000000002 | 2.933 | 3.067 | 3.206 |
| 0.896000000000002 | 2.918 | 3.051 | 3.191 |
| 0.900000000000002 | 2.903 | 3.037 | 3.176 |
| 0.904000000000002 | 2.888 | 3.022 | 3.162 |
| 0.908000000000002 | 2.874 | 3.007 | 3.147 |
| 0.912000000000002 | 2.859 | 2.993 | 3.132 |
| 0.916000000000002 | 2.845 | 2.979 | 3.118 |
| 0.920000000000002 | 2.831 | 2.965 | 3.104 |
| 0.924000000000002 | 2.818 | 2.951 | 3.09 |
| 0.928000000000002 | 2.804 | 2.937 | 3.077 |
| 0.932000000000002 | 2.791 | 2.924 | 3.063 |
| 0.936000000000002 | 2.777 | 2.91 | 3.05 |
| 0.940000000000002 | 2.764 | 2.897 | 3.037 |
| 0.944000000000002 | 2.751 | 2.884 | 3.024 |
| 0.948000000000002 | 2.738 | 2.871 | 3.011 |
| 0.952000000000002 | 2.726 | 2.859 | 2.998 |
| 0.956000000000002 | 2.713 | 2.846 | 2.986 |
| 0.960000000000002 | 2.701 | 2.834 | 2.973 |
| 0.964000000000002 | 2.689 | 2.822 | 2.961 |
| 0.968000000000002 | 2.677 | 2.81 | 2.949 |
| 0.972000000000002 | 2.665 | 2.798 | 2.937 |
| 0.976000000000003 | 2.653 | 2.786 | 2.925 |
| 0.980000000000002 | 2.642 | 2.774 | 2.914 |
| 0.984000000000003 | 2.63 | 2.763 | 2.902 |
| 0.988000000000003 | 2.619 | 2.751 | 2.891 |
| 0.992000000000002 | 2.608 | 2.74 | 2.88 |
| 0.996000000000003 | 2.597 | 2.729 | 2.869 |
| 1.000000000000002 | 2.586 | 2.718 | 2.858 |
| 1.004000000000002 | 2.575 | 2.707 | 2.847 |
| 1.008000000000002 | 2.564 | 2.697 | 2.836 |
| 1.012000000000002 | 2.554 | 2.686 | 2.826 |
| 1.016000000000002 | 2.543 | 2.676 | 2.815 |
| 1.020000000000002 | 2.533 | 2.666 | 2.805 |
| 1.024000000000002 | 2.523 | 2.655 | 2.795 |
| 1.028000000000002 | 2.513 | 2.645 | 2.785 |
| 1.032000000000002 | 2.503 | 2.635 | 2.775 |
| 1.036000000000002 | 2.493 | 2.625 | 2.765 |
| 1.040000000000002 | 2.483 | 2.616 | 2.755 |
| 1.044000000000002 | 2.474 | 2.606 | 2.746 |
| 1.048000000000002 | 2.464 | 2.597 | 2.736 |
| 1.052000000000002 | 2.455 | 2.587 | 2.727 |
| 1.056000000000002 | 2.445 | 2.578 | 2.718 |
| 1.060000000000002 | 2.436 | 2.569 | 2.709 |
| 1.064000000000002 | 2.427 | 2.56 | 2.7 |
| 1.068000000000002 | 2.418 | 2.551 | 2.691 |
| 1.072000000000002 | 2.409 | 2.542 | 2.682 |
| 1.076000000000003 | 2.401 | 2.533 | 2.673 |
| 1.080000000000002 | 2.392 | 2.525 | 2.665 |
| 1.084000000000003 | 2.383 | 2.516 | 2.656 |
| 1.088000000000003 | 2.375 | 2.508 | 2.648 |
| 1.092000000000002 | 2.366 | 2.499 | 2.639 |
| 1.096000000000003 | 2.358 | 2.491 | 2.631 |
| 1.100000000000003 | 2.35 | 2.483 | 2.623 |
| 1.104000000000003 | 2.342 | 2.475 | 2.615 |
| 1.108000000000003 | 2.334 | 2.467 | 2.607 |
| 1.112000000000003 | 2.326 | 2.459 | 2.599 |
| 1.116000000000003 | 2.318 | 2.451 | 2.592 |
| 1.120000000000003 | 2.31 | 2.443 | 2.584 |
| 1.124000000000003 | 2.303 | 2.436 | 2.576 |
| 1.128000000000003 | 2.295 | 2.428 | 2.569 |
| 1.132000000000003 | 2.287 | 2.421 | 2.562 |
| 1.136000000000003 | 2.28 | 2.413 | 2.554 |
| 1.140000000000003 | 2.273 | 2.406 | 2.547 |
| 1.144000000000003 | 2.265 | 2.399 | 2.54 |
| 1.148000000000003 | 2.258 | 2.392 | 2.533 |
| 1.152000000000003 | 2.251 | 2.385 | 2.526 |
| 1.156000000000003 | 2.244 | 2.378 | 2.519 |
| 1.160000000000003 | 2.237 | 2.371 | 2.512 |
| 1.164000000000003 | 2.23 | 2.364 | 2.505 |
| 1.168000000000003 | 2.223 | 2.357 | 2.499 |
| 1.172000000000003 | 2.217 | 2.35 | 2.492 |
| 1.176000000000003 | 2.21 | 2.344 | 2.486 |
| 1.180000000000003 | 2.203 | 2.337 | 2.479 |
| 1.184000000000003 | 2.197 | 2.331 | 2.473 |
| 1.188000000000003 | 2.19 | 2.324 | 2.467 |
| 1.192000000000003 | 2.184 | 2.318 | 2.46 |
| 1.196000000000003 | 2.178 | 2.312 | 2.454 |
| 1.200000000000003 | 2.171 | 2.306 | 2.448 |
| 1.204000000000003 | 2.165 | 2.3 | 2.442 |
| 1.208000000000003 | 2.159 | 2.293 | 2.436 |
| 1.212000000000003 | 2.153 | 2.287 | 2.43 |
| 1.216000000000003 | 2.147 | 2.282 | 2.425 |
| 1.220000000000003 | 2.141 | 2.276 | 2.419 |
| 1.224000000000003 | 2.135 | 2.27 | 2.413 |
| 1.228000000000003 | 2.129 | 2.264 | 2.408 |
| 1.232000000000003 | 2.124 | 2.259 | 2.402 |
| 1.236000000000003 | 2.118 | 2.253 | 2.397 |
| 1.240000000000003 | 2.112 | 2.247 | 2.391 |
| 1.244000000000003 | 2.107 | 2.242 | 2.386 |
| 1.248000000000003 | 2.101 | 2.237 | 2.381 |
| 1.252000000000003 | 2.096 | 2.231 | 2.375 |
| 1.256000000000003 | 2.09 | 2.226 | 2.37 |
| 1.260000000000003 | 2.085 | 2.221 | 2.365 |
| 1.264000000000003 | 2.08 | 2.215 | 2.36 |
| 1.268000000000003 | 2.074 | 2.21 | 2.355 |
| 1.272000000000003 | 2.069 | 2.205 | 2.35 |
| 1.276000000000003 | 2.064 | 2.2 | 2.345 |
| 1.280000000000003 | 2.059 | 2.195 | 2.34 |
| 1.284000000000003 | 2.054 | 2.19 | 2.336 |
| 1.288000000000003 | 2.049 | 2.185 | 2.331 |
| 1.292000000000003 | 2.044 | 2.181 | 2.326 |
| 1.296000000000003 | 2.039 | 2.176 | 2.322 |
| 1.300000000000003 | 2.035 | 2.171 | 2.317 |
| 1.304000000000003 | 2.03 | 2.167 | 2.312 |
| 1.308000000000003 | 2.025 | 2.162 | 2.308 |
| 1.312000000000003 | 2.02 | 2.157 | 2.304 |
| 1.316000000000003 | 2.016 | 2.153 | 2.299 |
| 1.320000000000003 | 2.011 | 2.148 | 2.295 |
| 1.324000000000003 | 2.007 | 2.144 | 2.291 |
| 1.328000000000003 | 2.002 | 2.14 | 2.287 |
| 1.332000000000003 | 1.998 | 2.135 | 2.282 |
| 1.336000000000003 | 1.993 | 2.131 | 2.278 |
| 1.340000000000003 | 1.989 | 2.127 | 2.274 |
| 1.344000000000003 | 1.985 | 2.123 | 2.27 |
| 1.348000000000003 | 1.981 | 2.119 | 2.266 |
| 1.352000000000003 | 1.976 | 2.115 | 2.262 |
| 1.356000000000003 | 1.972 | 2.11 | 2.259 |
| 1.360000000000003 | 1.968 | 2.107 | 2.255 |
| 1.364000000000003 | 1.964 | 2.103 | 2.251 |
| 1.368000000000003 | 1.96 | 2.099 | 2.247 |
| 1.372000000000003 | 1.956 | 2.095 | 2.244 |
| 1.376000000000003 | 1.952 | 2.091 | 2.24 |
| 1.380000000000003 | 1.948 | 2.087 | 2.236 |
| 1.384000000000003 | 1.944 | 2.083 | 2.233 |
| 1.388000000000003 | 1.94 | 2.08 | 2.229 |
| 1.392000000000003 | 1.937 | 2.076 | 2.226 |
| 1.396000000000003 | 1.933 | 2.073 | 2.222 |
| 1.400000000000003 | 1.929 | 2.069 | 2.219 |
| 1.404000000000003 | 1.925 | 2.065 | 2.216 |
| 1.408000000000003 | 1.922 | 2.062 | 2.212 |
| 1.412000000000003 | 1.918 | 2.059 | 2.209 |
| 1.416000000000003 | 1.915 | 2.055 | 2.206 |
| 1.420000000000003 | 1.911 | 2.052 | 2.203 |
| 1.424000000000003 | 1.908 | 2.048 | 2.2 |
| 1.428000000000003 | 1.904 | 2.045 | 2.196 |
| 1.432000000000003 | 1.901 | 2.042 | 2.193 |
| 1.436000000000003 | 1.897 | 2.039 | 2.19 |
| 1.440000000000003 | 1.894 | 2.035 | 2.187 |
| 1.444000000000003 | 1.891 | 2.032 | 2.184 |
| 1.448000000000003 | 1.887 | 2.029 | 2.182 |
| 1.452000000000003 | 1.884 | 2.026 | 2.179 |
| 1.456000000000003 | 1.881 | 2.023 | 2.176 |
| 1.460000000000003 | 1.878 | 2.02 | 2.173 |
| 1.464000000000003 | 1.875 | 2.017 | 2.17 |
| 1.468000000000003 | 1.872 | 2.014 | 2.168 |
| 1.472000000000003 | 1.869 | 2.011 | 2.165 |
| 1.476000000000003 | 1.865 | 2.008 | 2.162 |
| 1.480000000000003 | 1.862 | 2.006 | 2.16 |
| 1.484000000000003 | 1.86 | 2.003 | 2.157 |
| 1.488000000000003 | 1.857 | 2 | 2.154 |
| 1.492000000000003 | 1.854 | 1.997 | 2.152 |
| 1.496000000000003 | 1.851 | 1.995 | 2.149 |
| 1.500000000000003 | 1.848 | 1.992 | 2.147 |
| 1.504000000000003 | 1.845 | 1.989 | 2.145 |
| 1.508000000000003 | 1.842 | 1.987 | 2.142 |
| 1.512000000000003 | 1.84 | 1.984 | 2.14 |
| 1.516000000000003 | 1.837 | 1.981 | 2.138 |
| 1.520000000000003 | 1.834 | 1.979 | 2.135 |
| 1.524000000000003 | 1.831 | 1.976 | 2.133 |
| 1.528000000000003 | 1.829 | 1.974 | 2.131 |
| 1.532000000000003 | 1.826 | 1.972 | 2.129 |
| 1.536000000000003 | 1.824 | 1.969 | 2.126 |
| 1.540000000000003 | 1.821 | 1.967 | 2.124 |
| 1.544000000000003 | 1.819 | 1.965 | 2.122 |
| 1.548000000000003 | 1.816 | 1.962 | 2.12 |
| 1.552000000000003 | 1.814 | 1.96 | 2.118 |
| 1.556000000000003 | 1.811 | 1.958 | 2.116 |
| 1.560000000000003 | 1.809 | 1.955 | 2.114 |
| 1.564000000000003 | 1.806 | 1.953 | 2.112 |
| 1.568000000000003 | 1.804 | 1.951 | 2.11 |
| 1.572000000000003 | 1.802 | 1.949 | 2.108 |
| 1.576000000000003 | 1.799 | 1.947 | 2.106 |
| 1.580000000000003 | 1.797 | 1.945 | 2.105 |
| 1.584000000000003 | 1.795 | 1.943 | 2.103 |
| 1.588000000000003 | 1.793 | 1.941 | 2.101 |
| 1.592000000000003 | 1.79 | 1.939 | 2.099 |
| 1.596000000000003 | 1.788 | 1.937 | 2.098 |
| 1.600000000000003 | 1.786 | 1.935 | 2.096 |
| 1.604000000000003 | 1.784 | 1.933 | 2.094 |
| 1.608000000000003 | 1.782 | 1.931 | 2.093 |
| 1.612000000000003 | 1.78 | 1.929 | 2.091 |
| 1.616000000000003 | 1.778 | 1.927 | 2.089 |
| 1.620000000000003 | 1.776 | 1.925 | 2.088 |
| 1.624000000000003 | 1.774 | 1.924 | 2.086 |
| 1.628000000000003 | 1.772 | 1.922 | 2.085 |
| 1.632000000000003 | 1.77 | 1.92 | 2.083 |
| 1.636000000000003 | 1.768 | 1.918 | 2.082 |
| 1.640000000000003 | 1.766 | 1.917 | 2.08 |
| 1.644000000000003 | 1.764 | 1.915 | 2.079 |
| 1.648000000000003 | 1.762 | 1.913 | 2.078 |
| 1.652000000000003 | 1.76 | 1.912 | 2.076 |
| 1.656000000000003 | 1.758 | 1.91 | 2.075 |
| 1.660000000000003 | 1.757 | 1.909 | 2.074 |
| 1.664000000000003 | 1.755 | 1.907 | 2.072 |
| 1.668000000000003 | 1.753 | 1.906 | 2.071 |
| 1.672000000000003 | 1.751 | 1.904 | 2.07 |
| 1.676000000000003 | 1.75 | 1.903 | 2.069 |
| 1.680000000000003 | 1.748 | 1.901 | 2.068 |
| 1.684000000000003 | 1.746 | 1.9 | 2.066 |
| 1.688000000000003 | 1.745 | 1.898 | 2.065 |
| 1.692000000000003 | 1.743 | 1.897 | 2.064 |
| 1.696000000000003 | 1.741 | 1.895 | 2.063 |
| 1.700000000000003 | 1.74 | 1.894 | 2.062 |
| 1.704000000000003 | 1.738 | 1.893 | 2.061 |
| 1.708000000000003 | 1.737 | 1.891 | 2.06 |
| 1.712000000000003 | 1.735 | 1.89 | 2.059 |
| 1.716000000000003 | 1.734 | 1.889 | 2.058 |
| 1.720000000000003 | 1.732 | 1.888 | 2.057 |
| 1.724000000000003 | 1.731 | 1.886 | 2.056 |
| 1.728000000000003 | 1.729 | 1.885 | 2.055 |
| 1.732000000000003 | 1.728 | 1.884 | 2.055 |
| 1.736000000000003 | 1.726 | 1.883 | 2.054 |
| 1.740000000000003 | 1.725 | 1.882 | 2.053 |
| 1.744000000000003 | 1.724 | 1.881 | 2.052 |
| 1.748000000000003 | 1.722 | 1.88 | 2.051 |
| 1.752000000000003 | 1.721 | 1.879 | 2.051 |
| 1.756000000000003 | 1.72 | 1.877 | 2.05 |
| 1.760000000000003 | 1.718 | 1.876 | 2.049 |
| 1.764000000000003 | 1.717 | 1.875 | 2.048 |
| 1.768000000000003 | 1.716 | 1.874 | 2.048 |
| 1.772000000000003 | 1.715 | 1.873 | 2.047 |
| 1.776000000000003 | 1.713 | 1.872 | 2.046 |
| 1.780000000000003 | 1.712 | 1.872 | 2.046 |
| 1.784000000000003 | 1.711 | 1.871 | 2.045 |
| 1.788000000000003 | 1.71 | 1.87 | 2.045 |
| 1.792000000000003 | 1.709 | 1.869 | 2.044 |
| 1.796000000000003 | 1.708 | 1.868 | 2.044 |
| 1.800000000000003 | 1.706 | 1.867 | 2.043 |
| 1.804000000000003 | 1.705 | 1.866 | 2.043 |
| 1.808000000000003 | 1.704 | 1.866 | 2.042 |
| 1.812000000000003 | 1.703 | 1.865 | 2.042 |
| 1.816000000000003 | 1.702 | 1.864 | 2.041 |
| 1.820000000000003 | 1.701 | 1.863 | 2.041 |
| 1.824000000000003 | 1.7 | 1.863 | 2.04 |
| 1.828000000000003 | 1.699 | 1.862 | 2.04 |
| 1.832000000000003 | 1.698 | 1.861 | 2.04 |
| 1.836000000000003 | 1.697 | 1.86 | 2.039 |
| 1.840000000000003 | 1.696 | 1.86 | 2.039 |
| 1.844000000000003 | 1.695 | 1.859 | 2.039 |
| 1.848000000000003 | 1.695 | 1.859 | 2.038 |
| 1.852000000000003 | 1.694 | 1.858 | 2.038 |
| 1.856000000000003 | 1.693 | 1.857 | 2.038 |
| 1.860000000000003 | 1.692 | 1.857 | 2.038 |
| 1.864000000000003 | 1.691 | 1.856 | 2.038 |
| 1.868000000000003 | 1.69 | 1.856 | 2.037 |
| 1.872000000000003 | 1.689 | 1.855 | 2.037 |
| 1.876000000000003 | 1.689 | 1.855 | 2.037 |
| 1.880000000000003 | 1.688 | 1.854 | 2.037 |
| 1.884000000000003 | 1.687 | 1.854 | 2.037 |
| 1.888000000000003 | 1.686 | 1.853 | 2.037 |
| 1.892000000000003 | 1.686 | 1.853 | 2.037 |
| 1.896000000000003 | 1.685 | 1.852 | 2.037 |
| 1.900000000000003 | 1.684 | 1.852 | 2.037 |
| 1.904000000000003 | 1.684 | 1.852 | 2.037 |
| 1.908000000000003 | 1.683 | 1.851 | 2.037 |
| 1.912000000000003 | 1.682 | 1.851 | 2.037 |
| 1.916000000000003 | 1.682 | 1.851 | 2.037 |
| 1.920000000000003 | 1.681 | 1.85 | 2.037 |
| 1.924000000000003 | 1.68 | 1.85 | 2.037 |
| 1.928000000000003 | 1.68 | 1.85 | 2.037 |
| 1.932000000000003 | 1.679 | 1.849 | 2.037 |
| 1.936000000000003 | 1.679 | 1.849 | 2.037 |
| 1.940000000000003 | 1.678 | 1.849 | 2.037 |
| 1.944000000000003 | 1.677 | 1.849 | 2.037 |
| 1.948000000000003 | 1.677 | 1.849 | 2.038 |
| 1.952000000000003 | 1.676 | 1.848 | 2.038 |
| 1.956000000000003 | 1.676 | 1.848 | 2.038 |
| 1.960000000000003 | 1.675 | 1.848 | 2.038 |
| 1.964000000000003 | 1.675 | 1.848 | 2.039 |
| 1.968000000000003 | 1.675 | 1.848 | 2.039 |
| 1.972000000000003 | 1.674 | 1.848 | 2.039 |
| 1.976000000000003 | 1.674 | 1.848 | 2.039 |
| 1.980000000000003 | 1.673 | 1.847 | 2.04 |
| 1.984000000000003 | 1.673 | 1.847 | 2.04 |
| 1.988000000000003 | 1.673 | 1.847 | 2.04 |
| 1.992000000000003 | 1.672 | 1.847 | 2.041 |
| 1.996000000000003 | 1.672 | 1.847 | 2.041 |
| 2.000000000000003 | 1.671 | 1.847 | 2.042 |
| 2.004000000000003 | 1.671 | 1.847 | 2.042 |
| 2.008000000000003 | 1.671 | 1.847 | 2.042 |
| 2.012000000000003 | 1.671 | 1.847 | 2.043 |
| 2.016000000000003 | 1.67 | 1.847 | 2.043 |
| 2.020000000000003 | 1.67 | 1.847 | 2.044 |
| 2.024000000000003 | 1.67 | 1.848 | 2.044 |
| 2.028000000000003 | 1.669 | 1.848 | 2.045 |
| 2.032000000000003 | 1.669 | 1.848 | 2.045 |
| 2.036000000000003 | 1.669 | 1.848 | 2.046 |
| 2.040000000000003 | 1.669 | 1.848 | 2.046 |
| 2.044000000000003 | 1.669 | 1.848 | 2.047 |
| 2.048000000000003 | 1.668 | 1.848 | 2.048 |
| 2.052000000000003 | 1.668 | 1.848 | 2.048 |
| 2.056000000000003 | 1.668 | 1.849 | 2.049 |
| 2.060000000000003 | 1.668 | 1.849 | 2.049 |
| 2.064000000000003 | 1.668 | 1.849 | 2.05 |
| 2.068000000000003 | 1.668 | 1.849 | 2.051 |
| 2.072000000000003 | 1.668 | 1.85 | 2.052 |
| 2.076000000000003 | 1.667 | 1.85 | 2.052 |
| 2.080000000000003 | 1.667 | 1.85 | 2.053 |
| 2.084000000000003 | 1.667 | 1.85 | 2.054 |
| 2.088000000000003 | 1.667 | 1.851 | 2.054 |
| 2.092000000000003 | 1.667 | 1.851 | 2.055 |
| 2.096000000000003 | 1.667 | 1.851 | 2.056 |
| 2.100000000000003 | 1.667 | 1.852 | 2.057 |
| 2.104000000000003 | 1.667 | 1.852 | 2.058 |
| 2.108000000000003 | 1.667 | 1.852 | 2.058 |
| 2.112000000000003 | 1.667 | 1.853 | 2.059 |
| 2.116000000000003 | 1.667 | 1.853 | 2.06 |
| 2.120000000000003 | 1.667 | 1.854 | 2.061 |
| 2.124000000000003 | 1.667 | 1.854 | 2.062 |
| 2.128000000000003 | 1.667 | 1.855 | 2.063 |
| 2.132000000000003 | 1.667 | 1.855 | 2.064 |
| 2.136000000000003 | 1.668 | 1.855 | 2.065 |
| 2.140000000000003 | 1.668 | 1.856 | 2.066 |
| 2.144000000000003 | 1.668 | 1.856 | 2.066 |
| 2.148000000000003 | 1.668 | 1.857 | 2.067 |
| 2.152000000000003 | 1.668 | 1.857 | 2.068 |
| 2.156000000000003 | 1.668 | 1.858 | 2.069 |
| 2.160000000000003 | 1.668 | 1.859 | 2.07 |
| 2.164000000000003 | 1.668 | 1.859 | 2.072 |
| 2.168000000000003 | 1.669 | 1.86 | 2.073 |
| 2.172000000000003 | 1.669 | 1.86 | 2.074 |
| 2.176000000000003 | 1.669 | 1.861 | 2.075 |
| 2.180000000000003 | 1.669 | 1.861 | 2.076 |
| 2.184000000000003 | 1.669 | 1.862 | 2.077 |
| 2.188000000000003 | 1.67 | 1.863 | 2.078 |
| 2.192000000000003 | 1.67 | 1.863 | 2.079 |
| 2.196000000000003 | 1.67 | 1.864 | 2.08 |
| 2.200000000000003 | 1.67 | 1.865 | 2.081 |
| 2.204000000000003 | 1.671 | 1.865 | 2.083 |
| 2.208000000000003 | 1.671 | 1.866 | 2.084 |
| 2.212000000000003 | 1.671 | 1.867 | 2.085 |
| 2.216000000000003 | 1.672 | 1.867 | 2.086 |
| 2.220000000000003 | 1.672 | 1.868 | 2.088 |
| 2.224000000000003 | 1.672 | 1.869 | 2.089 |
| 2.228000000000003 | 1.673 | 1.87 | 2.09 |
| 2.232000000000003 | 1.673 | 1.87 | 2.091 |
| 2.236000000000003 | 1.673 | 1.871 | 2.093 |
| 2.240000000000003 | 1.674 | 1.872 | 2.094 |
| 2.244000000000003 | 1.674 | 1.873 | 2.095 |
| 2.248000000000003 | 1.675 | 1.874 | 2.097 |
| 2.252000000000003 | 1.675 | 1.875 | 2.098 |
| 2.256000000000003 | 1.675 | 1.875 | 2.099 |
| 2.260000000000003 | 1.676 | 1.876 | 2.101 |
| 2.264000000000003 | 1.676 | 1.877 | 2.102 |
| 2.268000000000003 | 1.677 | 1.878 | 2.104 |
| 2.272000000000003 | 1.677 | 1.879 | 2.105 |
| 2.276000000000003 | 1.678 | 1.88 | 2.106 |
| 2.280000000000003 | 1.678 | 1.881 | 2.108 |
| 2.284000000000003 | 1.679 | 1.882 | 2.109 |
| 2.288000000000003 | 1.679 | 1.883 | 2.111 |
| 2.292000000000003 | 1.68 | 1.884 | 2.112 |
| 2.296000000000003 | 1.68 | 1.885 | 2.114 |
| 2.300000000000003 | 1.681 | 1.885 | 2.115 |
| 2.304000000000003 | 1.681 | 1.886 | 2.117 |
| 2.308000000000003 | 1.682 | 1.887 | 2.118 |
| 2.312000000000003 | 1.682 | 1.888 | 2.12 |
| 2.316000000000003 | 1.683 | 1.89 | 2.121 |
| 2.320000000000003 | 1.683 | 1.891 | 2.123 |
| 2.324000000000003 | 1.684 | 1.892 | 2.125 |
| 2.328000000000003 | 1.685 | 1.893 | 2.126 |
| 2.332000000000003 | 1.685 | 1.894 | 2.128 |
| 2.336000000000003 | 1.686 | 1.895 | 2.13 |
| 2.340000000000003 | 1.687 | 1.896 | 2.131 |
| 2.344000000000003 | 1.687 | 1.897 | 2.133 |
| 2.348000000000003 | 1.688 | 1.898 | 2.135 |
| 2.352000000000003 | 1.689 | 1.899 | 2.136 |
| 2.356000000000003 | 1.689 | 1.9 | 2.138 |
| 2.360000000000003 | 1.69 | 1.902 | 2.14 |
| 2.364000000000003 | 1.691 | 1.903 | 2.141 |
| 2.368000000000003 | 1.691 | 1.904 | 2.143 |
| 2.372000000000003 | 1.692 | 1.905 | 2.145 |
| 2.376000000000003 | 1.693 | 1.906 | 2.147 |
| 2.380000000000003 | 1.694 | 1.908 | 2.149 |
| 2.384000000000003 | 1.694 | 1.909 | 2.15 |
| 2.388000000000003 | 1.695 | 1.91 | 2.152 |
| 2.392000000000003 | 1.696 | 1.911 | 2.154 |
| 2.396000000000003 | 1.697 | 1.912 | 2.156 |
| 2.400000000000003 | 1.697 | 1.914 | 2.158 |
| 2.404000000000003 | 1.698 | 1.915 | 2.16 |
| 2.408000000000003 | 1.699 | 1.916 | 2.162 |
| 2.412000000000003 | 1.7 | 1.918 | 2.163 |
| 2.416000000000003 | 1.701 | 1.919 | 2.165 |
| 2.420000000000003 | 1.701 | 1.92 | 2.167 |
| 2.424000000000003 | 1.702 | 1.922 | 2.169 |
| 2.428000000000003 | 1.703 | 1.923 | 2.171 |
| 2.432000000000003 | 1.704 | 1.924 | 2.173 |
| 2.436000000000003 | 1.705 | 1.926 | 2.175 |
| 2.440000000000003 | 1.706 | 1.927 | 2.177 |
| 2.444000000000003 | 1.707 | 1.928 | 2.179 |
| 2.448000000000003 | 1.708 | 1.93 | 2.181 |
| 2.452000000000003 | 1.708 | 1.931 | 2.183 |
| 2.456000000000003 | 1.709 | 1.933 | 2.185 |
| 2.460000000000003 | 1.71 | 1.934 | 2.187 |
| 2.464000000000003 | 1.711 | 1.936 | 2.189 |
| 2.468000000000003 | 1.712 | 1.937 | 2.191 |
| 2.472000000000003 | 1.713 | 1.939 | 2.194 |
| 2.476000000000004 | 1.714 | 1.94 | 2.196 |
| 2.480000000000003 | 1.715 | 1.942 | 2.198 |
| 2.484000000000003 | 1.716 | 1.943 | 2.2 |
| 2.488000000000004 | 1.717 | 1.945 | 2.202 |
| 2.492000000000003 | 1.718 | 1.946 | 2.204 |
| 2.496000000000004 | 1.719 | 1.948 | 2.207 |
| 2.500000000000004 | 1.72 | 1.949 | 2.209 |
| 2.504000000000004 | 1.721 | 1.951 | 2.211 |
| 2.508000000000004 | 1.722 | 1.952 | 2.213 |
| 2.512000000000004 | 1.723 | 1.954 | 2.215 |
| 2.516000000000004 | 1.724 | 1.956 | 2.218 |
| 2.520000000000004 | 1.725 | 1.957 | 2.22 |
| 2.524000000000004 | 1.727 | 1.959 | 2.222 |
| 2.528000000000004 | 1.728 | 1.96 | 2.225 |
| 2.532000000000004 | 1.729 | 1.962 | 2.227 |
| 2.536000000000004 | 1.73 | 1.964 | 2.229 |
| 2.540000000000004 | 1.731 | 1.965 | 2.231 |
| 2.544000000000004 | 1.732 | 1.967 | 2.234 |
| 2.548000000000004 | 1.733 | 1.969 | 2.236 |
| 2.552000000000004 | 1.734 | 1.97 | 2.239 |
| 2.556000000000004 | 1.736 | 1.972 | 2.241 |
| 2.560000000000004 | 1.737 | 1.974 | 2.243 |
| 2.564000000000004 | 1.738 | 1.976 | 2.246 |
| 2.568000000000004 | 1.739 | 1.977 | 2.248 |
| 2.572000000000004 | 1.74 | 1.979 | 2.251 |
| 2.576000000000004 | 1.741 | 1.981 | 2.253 |
| 2.580000000000004 | 1.743 | 1.983 | 2.256 |
| 2.584000000000004 | 1.744 | 1.984 | 2.258 |
| 2.588000000000004 | 1.745 | 1.986 | 2.261 |
| 2.592000000000004 | 1.746 | 1.988 | 2.263 |
| 2.596000000000004 | 1.748 | 1.99 | 2.266 |
| 2.600000000000004 | 1.749 | 1.992 | 2.268 |
| 2.604000000000004 | 1.75 | 1.994 | 2.271 |
| 2.608000000000004 | 1.751 | 1.995 | 2.273 |
| 2.612000000000004 | 1.753 | 1.997 | 2.276 |
| 2.616000000000004 | 1.754 | 1.999 | 2.278 |
| 2.620000000000004 | 1.755 | 2.001 | 2.281 |
| 2.624000000000004 | 1.757 | 2.003 | 2.284 |
| 2.628000000000004 | 1.758 | 2.005 | 2.286 |
| 2.632000000000004 | 1.759 | 2.007 | 2.289 |
| 2.636000000000004 | 1.761 | 2.009 | 2.292 |
| 2.640000000000004 | 1.762 | 2.011 | 2.294 |
| 2.644000000000004 | 1.763 | 2.013 | 2.297 |
| 2.648000000000004 | 1.765 | 2.015 | 2.3 |
| 2.652000000000004 | 1.766 | 2.017 | 2.302 |
| 2.656000000000004 | 1.767 | 2.019 | 2.305 |
| 2.660000000000004 | 1.769 | 2.021 | 2.308 |
| 2.664000000000004 | 1.77 | 2.023 | 2.311 |
| 2.668000000000004 | 1.772 | 2.025 | 2.313 |
| 2.672000000000004 | 1.773 | 2.027 | 2.316 |
| 2.676000000000004 | 1.775 | 2.029 | 2.319 |
| 2.680000000000004 | 1.776 | 2.031 | 2.322 |
| 2.684000000000004 | 1.777 | 2.033 | 2.325 |
| 2.688000000000004 | 1.779 | 2.035 | 2.328 |
| 2.692000000000004 | 1.78 | 2.037 | 2.33 |
| 2.696000000000004 | 1.782 | 2.039 | 2.333 |
| 2.700000000000004 | 1.783 | 2.041 | 2.336 |
| 2.704000000000004 | 1.785 | 2.043 | 2.339 |
| 2.708000000000004 | 1.786 | 2.045 | 2.342 |
| 2.712000000000004 | 1.788 | 2.048 | 2.345 |
| 2.716000000000004 | 1.789 | 2.05 | 2.348 |
| 2.720000000000004 | 1.791 | 2.052 | 2.351 |
| 2.724000000000004 | 1.792 | 2.054 | 2.354 |
| 2.728000000000004 | 1.794 | 2.056 | 2.357 |
| 2.732000000000004 | 1.796 | 2.058 | 2.36 |
| 2.736000000000004 | 1.797 | 2.061 | 2.363 |
| 2.740000000000004 | 1.799 | 2.063 | 2.366 |
| 2.744000000000004 | 1.8 | 2.065 | 2.369 |
| 2.748000000000004 | 1.802 | 2.067 | 2.372 |
| 2.752000000000004 | 1.804 | 2.07 | 2.375 |
| 2.756000000000004 | 1.805 | 2.072 | 2.378 |
| 2.760000000000004 | 1.807 | 2.074 | 2.381 |
| 2.764000000000004 | 1.808 | 2.076 | 2.384 |
| 2.768000000000004 | 1.81 | 2.079 | 2.387 |
| 2.772000000000004 | 1.812 | 2.081 | 2.39 |
| 2.776000000000004 | 1.813 | 2.083 | 2.394 |
| 2.780000000000004 | 1.815 | 2.086 | 2.397 |
| 2.784000000000004 | 1.817 | 2.088 | 2.4 |
| 2.788000000000004 | 1.818 | 2.09 | 2.403 |
| 2.792000000000004 | 1.82 | 2.093 | 2.406 |
| 2.796000000000004 | 1.822 | 2.095 | 2.41 |
| 2.800000000000004 | 1.824 | 2.098 | 2.413 |
| 2.804000000000004 | 1.825 | 2.1 | 2.416 |
| 2.808000000000004 | 1.827 | 2.102 | 2.419 |
| 2.812000000000004 | 1.829 | 2.105 | 2.423 |
| 2.816000000000004 | 1.83 | 2.107 | 2.426 |
| 2.820000000000004 | 1.832 | 2.11 | 2.429 |
| 2.824000000000004 | 1.834 | 2.112 | 2.432 |
| 2.828000000000004 | 1.836 | 2.115 | 2.436 |
| 2.832000000000004 | 1.838 | 2.117 | 2.439 |
| 2.836000000000004 | 1.839 | 2.12 | 2.442 |
| 2.840000000000004 | 1.841 | 2.122 | 2.446 |
| 2.844000000000004 | 1.843 | 2.125 | 2.449 |
| 2.848000000000004 | 1.845 | 2.127 | 2.453 |
| 2.852000000000004 | 1.847 | 2.13 | 2.456 |
| 2.856000000000004 | 1.848 | 2.132 | 2.459 |
| 2.860000000000004 | 1.85 | 2.135 | 2.463 |
| 2.864000000000004 | 1.852 | 2.137 | 2.466 |
| 2.868000000000004 | 1.854 | 2.14 | 2.47 |
| 2.872000000000004 | 1.856 | 2.143 | 2.473 |
| 2.876000000000004 | 1.858 | 2.145 | 2.477 |
| 2.880000000000004 | 1.86 | 2.148 | 2.48 |
| 2.884000000000004 | 1.862 | 2.15 | 2.484 |
| 2.888000000000004 | 1.864 | 2.153 | 2.487 |
| 2.892000000000004 | 1.865 | 2.156 | 2.491 |
| 2.896000000000004 | 1.867 | 2.158 | 2.495 |
| 2.900000000000004 | 1.869 | 2.161 | 2.498 |
| 2.904000000000004 | 1.871 | 2.164 | 2.502 |
| 2.908000000000004 | 1.873 | 2.166 | 2.505 |
| 2.912000000000004 | 1.875 | 2.169 | 2.509 |
| 2.916000000000004 | 1.877 | 2.172 | 2.513 |
| 2.920000000000004 | 1.879 | 2.175 | 2.516 |
| 2.924000000000004 | 1.881 | 2.177 | 2.52 |
| 2.928000000000004 | 1.883 | 2.18 | 2.524 |
| 2.932000000000004 | 1.885 | 2.183 | 2.527 |
| 2.936000000000004 | 1.887 | 2.186 | 2.531 |
| 2.940000000000004 | 1.889 | 2.188 | 2.535 |
| 2.944000000000004 | 1.891 | 2.191 | 2.539 |
| 2.948000000000004 | 1.893 | 2.194 | 2.542 |
| 2.952000000000004 | 1.895 | 2.197 | 2.546 |
| 2.956000000000004 | 1.897 | 2.2 | 2.55 |
| 2.960000000000004 | 1.9 | 2.203 | 2.554 |
| 2.964000000000004 | 1.902 | 2.205 | 2.558 |
| 2.968000000000004 | 1.904 | 2.208 | 2.562 |
| 2.972000000000004 | 1.906 | 2.211 | 2.565 |
| 2.976000000000004 | 1.908 | 2.214 | 2.569 |
| 2.980000000000004 | 1.91 | 2.217 | 2.573 |
| 2.984000000000004 | 1.912 | 2.22 | 2.577 |
| 2.988000000000004 | 1.914 | 2.223 | 2.581 |
| 2.992000000000004 | 1.917 | 2.226 | 2.585 |
| 2.996000000000004 | 1.919 | 2.229 | 2.589 |
| 3.000000000000004 | 1.921 | 2.232 | 2.593 |
| 3.004000000000004 | 1.923 | 2.235 | 2.597 |
| 3.008000000000004 | 1.925 | 2.238 | 2.601 |
| 3.012000000000004 | 1.927 | 2.241 | 2.605 |
| 3.016000000000004 | 1.93 | 2.244 | 2.609 |
| 3.020000000000004 | 1.932 | 2.247 | 2.613 |
| 3.024000000000004 | 1.934 | 2.25 | 2.617 |
| 3.028000000000004 | 1.936 | 2.253 | 2.621 |
| 3.032000000000004 | 1.939 | 2.256 | 2.625 |
| 3.036000000000004 | 1.941 | 2.259 | 2.629 |
| 3.040000000000004 | 1.943 | 2.262 | 2.633 |
| 3.044000000000004 | 1.945 | 2.265 | 2.638 |
| 3.048000000000004 | 1.948 | 2.268 | 2.642 |
| 3.052000000000004 | 1.95 | 2.271 | 2.646 |
| 3.056000000000004 | 1.952 | 2.275 | 2.65 |
| 3.060000000000004 | 1.955 | 2.278 | 2.654 |
| 3.064000000000004 | 1.957 | 2.281 | 2.658 |
| 3.068000000000004 | 1.959 | 2.284 | 2.663 |
| 3.072000000000004 | 1.962 | 2.287 | 2.667 |
| 3.076000000000004 | 1.964 | 2.29 | 2.671 |
| 3.080000000000004 | 1.966 | 2.294 | 2.676 |
| 3.084000000000004 | 1.969 | 2.297 | 2.68 |
| 3.088000000000004 | 1.971 | 2.3 | 2.684 |
| 3.092000000000004 | 1.973 | 2.303 | 2.688 |
| 3.096000000000004 | 1.976 | 2.307 | 2.693 |
| 3.100000000000004 | 1.978 | 2.31 | 2.697 |
| 3.104000000000004 | 1.981 | 2.313 | 2.702 |
| 3.108000000000004 | 1.983 | 2.316 | 2.706 |
| 3.112000000000004 | 1.985 | 2.32 | 2.71 |
| 3.116000000000004 | 1.988 | 2.323 | 2.715 |
| 3.120000000000004 | 1.99 | 2.326 | 2.719 |
| 3.124000000000004 | 1.993 | 2.33 | 2.724 |
| 3.128000000000004 | 1.995 | 2.333 | 2.728 |
| 3.132000000000004 | 1.998 | 2.337 | 2.733 |
| 3.136000000000004 | 2 | 2.34 | 2.737 |
| 3.140000000000004 | 2.003 | 2.343 | 2.742 |
| 3.144000000000004 | 2.005 | 2.347 | 2.746 |
| 3.148000000000004 | 2.008 | 2.35 | 2.751 |
| 3.152000000000004 | 2.01 | 2.354 | 2.755 |
| 3.156000000000004 | 2.013 | 2.357 | 2.76 |
| 3.160000000000004 | 2.015 | 2.36 | 2.764 |
| 3.164000000000004 | 2.018 | 2.364 | 2.769 |
| 3.168000000000004 | 2.021 | 2.367 | 2.774 |
| 3.172000000000004 | 2.023 | 2.371 | 2.778 |
| 3.176000000000004 | 2.026 | 2.374 | 2.783 |
| 3.180000000000004 | 2.028 | 2.378 | 2.788 |
| 3.184000000000004 | 2.031 | 2.381 | 2.792 |
| 3.188000000000004 | 2.034 | 2.385 | 2.797 |
| 3.192000000000004 | 2.036 | 2.389 | 2.802 |
| 3.196000000000004 | 2.039 | 2.392 | 2.807 |
| 3.200000000000004 | 2.042 | 2.396 | 2.811 |
| 3.204000000000004 | 2.044 | 2.399 | 2.816 |
| 3.208000000000004 | 2.047 | 2.403 | 2.821 |
| 3.212000000000004 | 2.05 | 2.407 | 2.826 |
| 3.216000000000004 | 2.052 | 2.41 | 2.831 |
| 3.220000000000004 | 2.055 | 2.414 | 2.836 |
| 3.224000000000004 | 2.058 | 2.418 | 2.84 |
| 3.228000000000004 | 2.06 | 2.421 | 2.845 |
| 3.232000000000004 | 2.063 | 2.425 | 2.85 |
| 3.236000000000004 | 2.066 | 2.429 | 2.855 |
| 3.240000000000004 | 2.069 | 2.432 | 2.86 |
| 3.244000000000004 | 2.071 | 2.436 | 2.865 |
| 3.248000000000004 | 2.074 | 2.44 | 2.87 |
| 3.252000000000004 | 2.077 | 2.444 | 2.875 |
| 3.256000000000004 | 2.08 | 2.447 | 2.88 |
| 3.260000000000004 | 2.082 | 2.451 | 2.885 |
| 3.264000000000004 | 2.085 | 2.455 | 2.89 |
| 3.268000000000004 | 2.088 | 2.459 | 2.895 |
| 3.272000000000004 | 2.091 | 2.463 | 2.9 |
| 3.276000000000004 | 2.094 | 2.466 | 2.905 |
| 3.280000000000004 | 2.097 | 2.47 | 2.91 |
| 3.284000000000004 | 2.099 | 2.474 | 2.916 |
| 3.288000000000004 | 2.102 | 2.478 | 2.921 |
| 3.292000000000004 | 2.105 | 2.482 | 2.926 |
| 3.296000000000004 | 2.108 | 2.486 | 2.931 |
| 3.300000000000004 | 2.111 | 2.49 | 2.936 |
| 3.304000000000004 | 2.114 | 2.494 | 2.942 |
| 3.308000000000004 | 2.117 | 2.498 | 2.947 |
| 3.312000000000004 | 2.12 | 2.502 | 2.952 |
| 3.316000000000004 | 2.123 | 2.505 | 2.957 |
| 3.320000000000004 | 2.126 | 2.509 | 2.963 |
| 3.324000000000004 | 2.129 | 2.513 | 2.968 |
| 3.328000000000004 | 2.132 | 2.517 | 2.973 |
| 3.332000000000004 | 2.135 | 2.522 | 2.979 |
| 3.336000000000004 | 2.138 | 2.526 | 2.984 |
| 3.340000000000004 | 2.141 | 2.53 | 2.989 |
| 3.344000000000004 | 2.144 | 2.534 | 2.995 |
| 3.348000000000004 | 2.147 | 2.538 | 3 |
| 3.352000000000004 | 2.15 | 2.542 | 3.006 |
| 3.356000000000004 | 2.153 | 2.546 | 3.011 |
| 3.360000000000004 | 2.156 | 2.55 | 3.017 |
| 3.364000000000004 | 2.159 | 2.554 | 3.022 |
| 3.368000000000004 | 2.162 | 2.558 | 3.028 |
| 3.372000000000004 | 2.165 | 2.563 | 3.033 |
| 3.376000000000004 | 2.168 | 2.567 | 3.039 |
| 3.380000000000004 | 2.171 | 2.571 | 3.044 |
| 3.384000000000004 | 2.174 | 2.575 | 3.05 |
| 3.388000000000004 | 2.177 | 2.579 | 3.055 |
| 3.392000000000004 | 2.181 | 2.584 | 3.061 |
| 3.396000000000004 | 2.184 | 2.588 | 3.067 |
| 3.400000000000004 | 2.187 | 2.592 | 3.072 |
| 3.404000000000004 | 2.19 | 2.596 | 3.078 |
| 3.408000000000004 | 2.193 | 2.601 | 3.084 |
| 3.412000000000004 | 2.196 | 2.605 | 3.089 |
| 3.416000000000004 | 2.2 | 2.609 | 3.095 |
| 3.420000000000004 | 2.203 | 2.614 | 3.101 |
| 3.424000000000004 | 2.206 | 2.618 | 3.107 |
| 3.428000000000004 | 2.209 | 2.622 | 3.113 |
| 3.432000000000004 | 2.212 | 2.627 | 3.118 |
| 3.436000000000004 | 2.216 | 2.631 | 3.124 |
| 3.440000000000004 | 2.219 | 2.635 | 3.13 |
| 3.444000000000004 | 2.222 | 2.64 | 3.136 |
| 3.448000000000004 | 2.226 | 2.644 | 3.142 |
| 3.452000000000004 | 2.229 | 2.649 | 3.148 |
| 3.456000000000004 | 2.232 | 2.653 | 3.154 |
| 3.460000000000004 | 2.235 | 2.658 | 3.16 |
| 3.464000000000004 | 2.239 | 2.662 | 3.166 |
| 3.468000000000004 | 2.242 | 2.667 | 3.172 |
| 3.472000000000004 | 2.246 | 2.671 | 3.178 |
| 3.476000000000004 | 2.249 | 2.676 | 3.184 |
| 3.480000000000004 | 2.252 | 2.68 | 3.19 |
| 3.484000000000004 | 2.256 | 2.685 | 3.196 |
| 3.488000000000004 | 2.259 | 2.689 | 3.202 |
| 3.492000000000004 | 2.262 | 2.694 | 3.208 |
| 3.496000000000004 | 2.266 | 2.699 | 3.214 |
| 3.500000000000004 | 2.269 | 2.703 | 3.22 |
| 3.504000000000004 | 2.273 | 2.708 | 3.226 |
| 3.508000000000004 | 2.276 | 2.713 | 3.233 |
| 3.512000000000004 | 2.28 | 2.717 | 3.239 |
| 3.516000000000004 | 2.283 | 2.722 | 3.245 |
| 3.520000000000004 | 2.287 | 2.727 | 3.251 |
| 3.524000000000004 | 2.29 | 2.731 | 3.258 |
| 3.528000000000004 | 2.294 | 2.736 | 3.264 |
| 3.532000000000004 | 2.297 | 2.741 | 3.27 |
| 3.536000000000004 | 2.301 | 2.746 | 3.277 |
| 3.540000000000004 | 2.304 | 2.75 | 3.283 |
| 3.544000000000004 | 2.308 | 2.755 | 3.289 |
| 3.548000000000004 | 2.311 | 2.76 | 3.296 |
| 3.552000000000004 | 2.315 | 2.765 | 3.302 |
| 3.556000000000004 | 2.319 | 2.77 | 3.309 |
| 3.560000000000004 | 2.322 | 2.775 | 3.315 |
| 3.564000000000004 | 2.326 | 2.779 | 3.322 |
| 3.568000000000004 | 2.329 | 2.784 | 3.328 |
| 3.572000000000004 | 2.333 | 2.789 | 3.335 |
| 3.576000000000004 | 2.337 | 2.794 | 3.341 |
| 3.580000000000004 | 2.34 | 2.799 | 3.348 |
| 3.584000000000004 | 2.344 | 2.804 | 3.354 |
| 3.588000000000005 | 2.348 | 2.809 | 3.361 |
| 3.592000000000004 | 2.351 | 2.814 | 3.368 |
| 3.596000000000004 | 2.355 | 2.819 | 3.374 |
| 3.600000000000004 | 2.359 | 2.824 | 3.381 |
| 3.604000000000004 | 2.362 | 2.829 | 3.388 |
| 3.608000000000004 | 2.366 | 2.834 | 3.394 |
| 3.612000000000004 | 2.37 | 2.839 | 3.401 |
| 3.616000000000004 | 2.374 | 2.844 | 3.408 |
| 3.620000000000004 | 2.378 | 2.849 | 3.415 |
| 3.624000000000004 | 2.381 | 2.854 | 3.421 |
| 3.628000000000004 | 2.385 | 2.859 | 3.428 |
| 3.632000000000004 | 2.389 | 2.865 | 3.435 |
| 3.636000000000004 | 2.393 | 2.87 | 3.442 |
| 3.640000000000004 | 2.397 | 2.875 | 3.449 |
| 3.644000000000004 | 2.4 | 2.88 | 3.456 |
| 3.648000000000004 | 2.404 | 2.885 | 3.463 |
| 3.652000000000004 | 2.408 | 2.891 | 3.47 |
| 3.656000000000004 | 2.412 | 2.896 | 3.477 |
| 3.660000000000004 | 2.416 | 2.901 | 3.484 |
| 3.664000000000004 | 2.42 | 2.906 | 3.491 |
| 3.668000000000004 | 2.424 | 2.912 | 3.498 |
| 3.672000000000004 | 2.428 | 2.917 | 3.505 |
| 3.676000000000004 | 2.432 | 2.922 | 3.512 |
| 3.680000000000004 | 2.436 | 2.928 | 3.519 |
| 3.684000000000004 | 2.44 | 2.933 | 3.526 |
| 3.688000000000005 | 2.443 | 2.938 | 3.533 |
| 3.692000000000004 | 2.447 | 2.944 | 3.54 |
| 3.696000000000004 | 2.451 | 2.949 | 3.548 |
| 3.700000000000005 | 2.456 | 2.955 | 3.555 |
| 3.704000000000005 | 2.46 | 2.96 | 3.562 |
| 3.708000000000005 | 2.464 | 2.965 | 3.569 |
| 3.712000000000005 | 2.468 | 2.971 | 3.577 |
| 3.716000000000005 | 2.472 | 2.976 | 3.584 |
| 3.720000000000005 | 2.476 | 2.982 | 3.591 |
| 3.724000000000005 | 2.48 | 2.987 | 3.599 |
| 3.728000000000005 | 2.484 | 2.993 | 3.606 |
| 3.732000000000005 | 2.488 | 2.998 | 3.614 |
| 3.736000000000005 | 2.492 | 3.004 | 3.621 |
| 3.740000000000005 | 2.496 | 3.01 | 3.629 |
| 3.744000000000005 | 2.501 | 3.015 | 3.636 |
| 3.748000000000005 | 2.505 | 3.021 | 3.644 |
| 3.752000000000005 | 2.509 | 3.027 | 3.651 |
| 3.756000000000005 | 2.513 | 3.032 | 3.659 |
| 3.760000000000005 | 2.517 | 3.038 | 3.666 |
| 3.764000000000005 | 2.521 | 3.044 | 3.674 |
| 3.768000000000005 | 2.526 | 3.049 | 3.681 |
| 3.772000000000005 | 2.53 | 3.055 | 3.689 |
| 3.776000000000005 | 2.534 | 3.061 | 3.697 |
| 3.780000000000005 | 2.538 | 3.067 | 3.705 |
| 3.784000000000005 | 2.543 | 3.072 | 3.712 |
| 3.788000000000005 | 2.547 | 3.078 | 3.72 |
| 3.792000000000005 | 2.551 | 3.084 | 3.728 |
| 3.796000000000005 | 2.556 | 3.09 | 3.736 |
| 3.800000000000005 | 2.56 | 3.096 | 3.743 |
| 3.804000000000005 | 2.564 | 3.102 | 3.751 |
| 3.808000000000005 | 2.569 | 3.107 | 3.759 |
| 3.812000000000005 | 2.573 | 3.113 | 3.767 |
| 3.816000000000005 | 2.577 | 3.119 | 3.775 |
| 3.820000000000005 | 2.582 | 3.125 | 3.783 |
| 3.824000000000005 | 2.586 | 3.131 | 3.791 |
| 3.828000000000005 | 2.591 | 3.137 | 3.799 |
| 3.832000000000005 | 2.595 | 3.143 | 3.807 |
| 3.836000000000005 | 2.6 | 3.149 | 3.815 |
| 3.840000000000005 | 2.604 | 3.155 | 3.823 |
| 3.844000000000005 | 2.608 | 3.161 | 3.831 |
| 3.848000000000005 | 2.613 | 3.167 | 3.839 |
| 3.852000000000005 | 2.617 | 3.173 | 3.847 |
| 3.856000000000005 | 2.622 | 3.18 | 3.856 |
| 3.860000000000005 | 2.627 | 3.186 | 3.864 |
| 3.864000000000005 | 2.631 | 3.192 | 3.872 |
| 3.868000000000005 | 2.636 | 3.198 | 3.88 |
| 3.872000000000005 | 2.64 | 3.204 | 3.889 |
| 3.876000000000005 | 2.645 | 3.21 | 3.897 |
| 3.880000000000005 | 2.649 | 3.217 | 3.905 |
| 3.884000000000005 | 2.654 | 3.223 | 3.914 |
| 3.888000000000005 | 2.659 | 3.229 | 3.922 |
| 3.892000000000005 | 2.663 | 3.235 | 3.93 |
| 3.896000000000005 | 2.668 | 3.242 | 3.939 |
| 3.900000000000005 | 2.673 | 3.248 | 3.947 |
| 3.904000000000005 | 2.677 | 3.254 | 3.956 |
| 3.908000000000005 | 2.682 | 3.261 | 3.964 |
| 3.912000000000005 | 2.687 | 3.267 | 3.973 |
| 3.916000000000005 | 2.691 | 3.273 | 3.981 |
| 3.920000000000005 | 2.696 | 3.28 | 3.99 |
| 3.924000000000005 | 2.701 | 3.286 | 3.999 |
| 3.928000000000005 | 2.706 | 3.293 | 4.007 |
| 3.932000000000005 | 2.71 | 3.299 | 4.016 |
| 3.936000000000005 | 2.715 | 3.306 | 4.025 |
| 3.940000000000005 | 2.72 | 3.312 | 4.034 |
| 3.944000000000005 | 2.725 | 3.319 | 4.042 |
| 3.948000000000005 | 2.73 | 3.325 | 4.051 |
| 3.952000000000005 | 2.735 | 3.332 | 4.06 |
| 3.956000000000005 | 2.739 | 3.339 | 4.069 |
| 3.960000000000005 | 2.744 | 3.345 | 4.078 |
| 3.964000000000005 | 2.749 | 3.352 | 4.087 |
| 3.968000000000005 | 2.754 | 3.358 | 4.095 |
| 3.972000000000005 | 2.759 | 3.365 | 4.104 |
| 3.976000000000005 | 2.764 | 3.372 | 4.113 |
| 3.980000000000005 | 2.769 | 3.379 | 4.122 |
| 3.984000000000005 | 2.774 | 3.385 | 4.131 |
| 3.988000000000005 | 2.779 | 3.392 | 4.141 |
| 3.992000000000005 | 2.784 | 3.399 | 4.15 |
| 3.996000000000005 | 2.789 | 3.406 | 4.159 |
| 4.000000000000004 | 2.794 | 3.412 | 4.168 |
| 4.004000000000004 | 2.799 | 3.419 | 4.177 |
| 4.008000000000004 | 2.804 | 3.426 | 4.186 |
| 4.012000000000003 | 2.809 | 3.433 | 4.196 |
| 4.016000000000003 | 2.814 | 3.44 | 4.205 |
| 4.020000000000002 | 2.819 | 3.447 | 4.214 |
| 4.024000000000002 | 2.824 | 3.454 | 4.223 |
| 4.028000000000001 | 2.829 | 3.461 | 4.233 |
| 4.032000000000001 | 2.835 | 3.468 | 4.242 |
| 4.036 | 2.84 | 3.475 | 4.252 |
| 4.04 | 2.845 | 3.482 | 4.261 |
| 4.044 | 2.85 | 3.489 | 4.271 |
| 4.047999999999999 | 2.855 | 3.496 | 4.28 |
| 4.051999999999999 | 2.86 | 3.503 | 4.29 |
| 4.055999999999998 | 2.866 | 3.51 | 4.299 |
| 4.059999999999998 | 2.871 | 3.517 | 4.309 |
| 4.063999999999997 | 2.876 | 3.524 | 4.318 |
| 4.067999999999997 | 2.881 | 3.531 | 4.328 |
| 4.071999999999996 | 2.887 | 3.539 | 4.338 |
| 4.075999999999996 | 2.892 | 3.546 | 4.347 |
| 4.079999999999995 | 2.897 | 3.553 | 4.357 |
| 4.083999999999995 | 2.903 | 3.56 | 4.367 |
| 4.087999999999995 | 2.908 | 3.568 | 4.377 |
| 4.091999999999994 | 2.913 | 3.575 | 4.387 |
| 4.095999999999994 | 2.919 | 3.582 | 4.396 |
| 4.099999999999993 | 2.924 | 3.59 | 4.406 |
| 4.103999999999993 | 2.93 | 3.597 | 4.416 |
| 4.107999999999993 | 2.935 | 3.604 | 4.426 |
| 4.111999999999992 | 2.941 | 3.612 | 4.436 |
| 4.115999999999992 | 2.946 | 3.619 | 4.446 |
| 4.119999999999991 | 2.951 | 3.627 | 4.456 |
| 4.123999999999991 | 2.957 | 3.634 | 4.466 |
| 4.12799999999999 | 2.962 | 3.642 | 4.476 |
| 4.13199999999999 | 2.968 | 3.649 | 4.487 |
| 4.135999999999989 | 2.974 | 3.657 | 4.497 |
| 4.13999999999999 | 2.979 | 3.664 | 4.507 |
| 4.143999999999989 | 2.985 | 3.672 | 4.517 |
| 4.147999999999988 | 2.99 | 3.679 | 4.527 |
| 4.151999999999988 | 2.996 | 3.687 | 4.538 |
| 4.155999999999987 | 3.001 | 3.695 | 4.548 |
| 4.159999999999987 | 3.007 | 3.702 | 4.558 |
| 4.163999999999986 | 3.013 | 3.71 | 4.569 |
| 4.167999999999986 | 3.018 | 3.718 | 4.579 |
| 4.171999999999985 | 3.024 | 3.726 | 4.59 |
| 4.175999999999985 | 3.03 | 3.733 | 4.6 |
| 4.179999999999984 | 3.036 | 3.741 | 4.611 |
| 4.183999999999984 | 3.041 | 3.749 | 4.621 |
| 4.187999999999984 | 3.047 | 3.757 | 4.632 |
| 4.191999999999983 | 3.053 | 3.765 | 4.642 |
| 4.195999999999983 | 3.059 | 3.772 | 4.653 |
| 4.199999999999982 | 3.064 | 3.78 | 4.664 |
| 4.203999999999982 | 3.07 | 3.788 | 4.675 |
| 4.207999999999982 | 3.076 | 3.796 | 4.685 |
| 4.211999999999981 | 3.082 | 3.804 | 4.696 |
| 4.215999999999981 | 3.088 | 3.812 | 4.707 |
| 4.21999999999998 | 3.094 | 3.82 | 4.718 |
| 4.22399999999998 | 3.099 | 3.828 | 4.729 |
| 4.227999999999979 | 3.105 | 3.836 | 4.74 |
| 4.231999999999978 | 3.111 | 3.845 | 4.751 |
| 4.235999999999978 | 3.117 | 3.853 | 4.761 |
| 4.239999999999977 | 3.123 | 3.861 | 4.773 |
| 4.243999999999977 | 3.129 | 3.869 | 4.784 |
| 4.247999999999977 | 3.135 | 3.877 | 4.795 |
| 4.251999999999976 | 3.141 | 3.885 | 4.806 |
| 4.255999999999976 | 3.147 | 3.894 | 4.817 |
| 4.259999999999975 | 3.153 | 3.902 | 4.828 |
| 4.263999999999975 | 3.159 | 3.91 | 4.839 |
| 4.267999999999975 | 3.165 | 3.919 | 4.851 |
| 4.271999999999974 | 3.172 | 3.927 | 4.862 |
| 4.275999999999974 | 3.178 | 3.935 | 4.873 |
| 4.279999999999973 | 3.184 | 3.944 | 4.885 |
| 4.283999999999973 | 3.19 | 3.952 | 4.896 |
| 4.287999999999973 | 3.196 | 3.96 | 4.907 |
| 4.291999999999972 | 3.202 | 3.969 | 4.919 |
| 4.295999999999972 | 3.209 | 3.977 | 4.93 |
| 4.299999999999971 | 3.215 | 3.986 | 4.942 |
| 4.303999999999971 | 3.221 | 3.994 | 4.954 |
| 4.30799999999997 | 3.227 | 4.003 | 4.965 |
| 4.31199999999997 | 3.234 | 4.012 | 4.977 |
| 4.31599999999997 | 3.24 | 4.02 | 4.989 |
| 4.31999999999997 | 3.246 | 4.029 | 5 |
| 4.323999999999969 | 3.253 | 4.038 | 5.012 |
| 4.327999999999968 | 3.259 | 4.046 | 5.024 |
| 4.331999999999967 | 3.265 | 4.055 | 5.036 |
| 4.335999999999967 | 3.272 | 4.064 | 5.048 |
| 4.339999999999966 | 3.278 | 4.072 | 5.059 |
| 4.343999999999966 | 3.284 | 4.081 | 5.071 |
| 4.347999999999966 | 3.291 | 4.09 | 5.083 |
| 4.351999999999965 | 3.297 | 4.099 | 5.095 |
| 4.355999999999965 | 3.304 | 4.108 | 5.107 |
| 4.359999999999964 | 3.31 | 4.117 | 5.119 |
| 4.363999999999964 | 3.317 | 4.126 | 5.132 |
| 4.367999999999964 | 3.323 | 4.135 | 5.144 |
| 4.371999999999963 | 3.33 | 4.144 | 5.156 |
| 4.375999999999963 | 3.337 | 4.153 | 5.168 |
| 4.379999999999962 | 3.343 | 4.162 | 5.181 |
| 4.383999999999962 | 3.35 | 4.171 | 5.193 |
| 4.387999999999962 | 3.356 | 4.18 | 5.205 |
| 4.391999999999961 | 3.363 | 4.189 | 5.218 |
| 4.395999999999961 | 3.37 | 4.198 | 5.23 |
| 4.39999999999996 | 3.376 | 4.207 | 5.242 |
| 4.40399999999996 | 3.383 | 4.216 | 5.255 |
| 4.407999999999959 | 3.39 | 4.226 | 5.268 |
| 4.41199999999996 | 3.396 | 4.235 | 5.28 |
| 4.415999999999959 | 3.403 | 4.244 | 5.293 |
| 4.419999999999958 | 3.41 | 4.253 | 5.305 |
| 4.423999999999958 | 3.417 | 4.263 | 5.318 |
| 4.427999999999957 | 3.424 | 4.272 | 5.331 |
| 4.431999999999956 | 3.43 | 4.281 | 5.344 |
| 4.435999999999956 | 3.437 | 4.291 | 5.356 |
| 4.439999999999955 | 3.444 | 4.3 | 5.369 |
| 4.443999999999955 | 3.451 | 4.31 | 5.382 |
| 4.447999999999955 | 3.458 | 4.319 | 5.395 |
| 4.451999999999954 | 3.465 | 4.329 | 5.408 |
| 4.455999999999954 | 3.472 | 4.338 | 5.421 |
| 4.459999999999954 | 3.479 | 4.348 | 5.434 |
| 4.463999999999953 | 3.486 | 4.358 | 5.447 |
| 4.467999999999953 | 3.493 | 4.367 | 5.46 |
| 4.471999999999952 | 3.5 | 4.377 | 5.474 |
| 4.475999999999952 | 3.507 | 4.387 | 5.487 |
| 4.479999999999951 | 3.514 | 4.396 | 5.5 |
| 4.483999999999951 | 3.521 | 4.406 | 5.513 |
| 4.487999999999951 | 3.528 | 4.416 | 5.527 |
| 4.49199999999995 | 3.535 | 4.426 | 5.54 |
| 4.49599999999995 | 3.542 | 4.435 | 5.553 |
| 4.49999999999995 | 3.55 | 4.445 | 5.567 |
| 4.503999999999949 | 3.557 | 4.455 | 5.58 |
| 4.507999999999948 | 3.564 | 4.465 | 5.594 |
| 4.511999999999948 | 3.571 | 4.475 | 5.608 |
| 4.515999999999948 | 3.579 | 4.485 | 5.621 |
| 4.519999999999947 | 3.586 | 4.495 | 5.635 |
| 4.523999999999947 | 3.593 | 4.505 | 5.649 |
| 4.527999999999946 | 3.6 | 4.515 | 5.662 |
| 4.531999999999945 | 3.608 | 4.525 | 5.676 |
| 4.535999999999945 | 3.615 | 4.535 | 5.69 |
| 4.539999999999944 | 3.622 | 4.546 | 5.704 |
| 4.543999999999944 | 3.63 | 4.556 | 5.718 |
| 4.547999999999944 | 3.637 | 4.566 | 5.732 |
| 4.551999999999944 | 3.645 | 4.576 | 5.746 |
| 4.555999999999943 | 3.652 | 4.586 | 5.76 |
| 4.559999999999943 | 3.66 | 4.597 | 5.774 |
| 4.563999999999942 | 3.667 | 4.607 | 5.788 |
| 4.567999999999942 | 3.675 | 4.617 | 5.802 |
| 4.571999999999941 | 3.682 | 4.628 | 5.816 |
| 4.575999999999941 | 3.69 | 4.638 | 5.831 |
| 4.57999999999994 | 3.697 | 4.649 | 5.845 |
| 4.58399999999994 | 3.705 | 4.659 | 5.859 |
| 4.58799999999994 | 3.713 | 4.67 | 5.874 |
| 4.59199999999994 | 3.72 | 4.68 | 5.888 |
| 4.595999999999939 | 3.728 | 4.691 | 5.903 |
| 4.599999999999938 | 3.736 | 4.702 | 5.917 |
| 4.603999999999938 | 3.743 | 4.712 | 5.932 |
| 4.607999999999937 | 3.751 | 4.723 | 5.947 |
| 4.611999999999937 | 3.759 | 4.734 | 5.961 |
| 4.615999999999937 | 3.766 | 4.744 | 5.976 |
| 4.619999999999936 | 3.774 | 4.755 | 5.991 |
| 4.623999999999936 | 3.782 | 4.766 | 6.006 |
| 4.627999999999935 | 3.79 | 4.777 | 6.02 |
| 4.631999999999934 | 3.798 | 4.788 | 6.035 |
| 4.635999999999934 | 3.806 | 4.798 | 6.05 |
| 4.639999999999934 | 3.814 | 4.809 | 6.065 |
| 4.643999999999933 | 3.822 | 4.82 | 6.08 |
| 4.647999999999933 | 3.829 | 4.831 | 6.095 |
| 4.651999999999933 | 3.837 | 4.842 | 6.11 |
| 4.655999999999932 | 3.845 | 4.853 | 6.126 |
| 4.659999999999932 | 3.853 | 4.865 | 6.141 |
| 4.663999999999931 | 3.861 | 4.876 | 6.156 |
| 4.667999999999931 | 3.87 | 4.887 | 6.171 |
| 4.67199999999993 | 3.878 | 4.898 | 6.187 |
| 4.67599999999993 | 3.886 | 4.909 | 6.202 |
| 4.67999999999993 | 3.894 | 4.92 | 6.218 |
| 4.68399999999993 | 3.902 | 4.932 | 6.233 |
| 4.687999999999929 | 3.91 | 4.943 | 6.249 |
| 4.691999999999928 | 3.918 | 4.954 | 6.264 |
| 4.695999999999928 | 3.927 | 4.966 | 6.28 |
| 4.699999999999927 | 3.935 | 4.977 | 6.296 |
| 4.703999999999926 | 3.943 | 4.989 | 6.312 |
| 4.707999999999926 | 3.951 | 5 | 6.327 |
| 4.711999999999925 | 3.96 | 5.012 | 6.343 |
| 4.715999999999925 | 3.968 | 5.023 | 6.359 |
| 4.719999999999925 | 3.976 | 5.035 | 6.375 |
| 4.723999999999924 | 3.985 | 5.046 | 6.391 |
| 4.727999999999924 | 3.993 | 5.058 | 6.407 |
| 4.731999999999923 | 4.002 | 5.07 | 6.423 |
| 4.735999999999923 | 4.01 | 5.082 | 6.439 |
| 4.739999999999922 | 4.019 | 5.093 | 6.455 |
| 4.743999999999922 | 4.027 | 5.105 | 6.472 |
| 4.747999999999922 | 4.036 | 5.117 | 6.488 |
| 4.751999999999921 | 4.044 | 5.129 | 6.504 |
| 4.755999999999921 | 4.053 | 5.141 | 6.521 |
| 4.75999999999992 | 4.061 | 5.153 | 6.537 |
| 4.76399999999992 | 4.07 | 5.165 | 6.554 |
| 4.76799999999992 | 4.079 | 5.177 | 6.57 |
| 4.77199999999992 | 4.087 | 5.189 | 6.587 |
| 4.775999999999919 | 4.096 | 5.201 | 6.603 |
| 4.779999999999918 | 4.105 | 5.213 | 6.62 |
| 4.783999999999918 | 4.113 | 5.225 | 6.637 |
| 4.787999999999918 | 4.122 | 5.237 | 6.654 |
| 4.791999999999917 | 4.131 | 5.249 | 6.671 |
| 4.795999999999917 | 4.14 | 5.262 | 6.687 |
| 4.799999999999916 | 4.149 | 5.274 | 6.704 |
| 4.803999999999916 | 4.157 | 5.286 | 6.721 |
| 4.807999999999915 | 4.166 | 5.299 | 6.739 |
| 4.811999999999915 | 4.175 | 5.311 | 6.756 |
| 4.815999999999915 | 4.184 | 5.323 | 6.773 |
| 4.819999999999914 | 4.193 | 5.336 | 6.79 |
| 4.823999999999914 | 4.202 | 5.348 | 6.807 |
| 4.827999999999913 | 4.211 | 5.361 | 6.825 |
| 4.831999999999913 | 4.22 | 5.373 | 6.842 |
| 4.835999999999912 | 4.229 | 5.386 | 6.859 |
| 4.839999999999912 | 4.238 | 5.399 | 6.877 |
| 4.843999999999911 | 4.247 | 5.411 | 6.894 |
| 4.847999999999911 | 4.257 | 5.424 | 6.912 |
| 4.851999999999911 | 4.266 | 5.437 | 6.93 |
| 4.85599999999991 | 4.275 | 5.45 | 6.947 |
| 4.85999999999991 | 4.284 | 5.463 | 6.965 |
| 4.863999999999909 | 4.293 | 5.475 | 6.983 |
| 4.867999999999909 | 4.303 | 5.488 | 7.001 |
| 4.871999999999908 | 4.312 | 5.501 | 7.019 |
| 4.875999999999908 | 4.321 | 5.514 | 7.037 |
| 4.879999999999907 | 4.331 | 5.527 | 7.055 |
| 4.883999999999907 | 4.34 | 5.54 | 7.073 |
| 4.887999999999907 | 4.349 | 5.554 | 7.091 |
| 4.891999999999906 | 4.359 | 5.567 | 7.109 |
| 4.895999999999906 | 4.368 | 5.58 | 7.128 |
| 4.899999999999905 | 4.378 | 5.593 | 7.146 |
| 4.903999999999904 | 4.387 | 5.606 | 7.164 |
| 4.907999999999904 | 4.397 | 5.62 | 7.183 |
| 4.911999999999904 | 4.406 | 5.633 | 7.201 |
| 4.915999999999904 | 4.416 | 5.646 | 7.22 |
| 4.919999999999903 | 4.425 | 5.66 | 7.238 |
| 4.923999999999903 | 4.435 | 5.673 | 7.257 |
| 4.927999999999902 | 4.445 | 5.687 | 7.276 |
| 4.931999999999901 | 4.454 | 5.7 | 7.294 |
| 4.935999999999901 | 4.464 | 5.714 | 7.313 |
| 4.9399999999999 | 4.474 | 5.727 | 7.332 |
| 4.9439999999999 | 4.484 | 5.741 | 7.351 |
| 4.9479999999999 | 4.494 | 5.755 | 7.37 |
| 4.9519999999999 | 4.503 | 5.769 | 7.389 |
| 4.9559999999999 | 4.513 | 5.782 | 7.408 |
| 4.959999999999898 | 4.523 | 5.796 | 7.427 |
| 4.963999999999898 | 4.533 | 5.81 | 7.447 |
| 4.967999999999898 | 4.543 | 5.824 | 7.466 |
| 4.971999999999897 | 4.553 | 5.838 | 7.485 |
| 4.975999999999896 | 4.563 | 5.852 | 7.505 |
| 4.979999999999896 | 4.573 | 5.866 | 7.524 |
| 4.983999999999896 | 4.583 | 5.88 | 7.544 |
| 4.987999999999895 | 4.593 | 5.894 | 7.563 |
| 4.991999999999895 | 4.603 | 5.908 | 7.583 |
| 4.995999999999894 | 4.613 | 5.922 | 7.603 |
| 4.999999999999894 | 4.623 | 5.937 | 7.623 |
| 5.003999999999894 | 4.634 | 5.951 | 7.643 |
| 5.007999999999893 | 4.644 | 5.965 | 7.662 |
| 5.011999999999893 | 4.654 | 5.979 | 7.682 |
| 5.015999999999893 | 4.664 | 5.994 | 7.702 |
| 5.019999999999892 | 4.675 | 6.008 | 7.723 |
| 5.023999999999892 | 4.685 | 6.023 | 7.743 |
| 5.027999999999891 | 4.695 | 6.037 | 7.763 |
| 5.03199999999989 | 4.706 | 6.052 | 7.783 |
| 5.03599999999989 | 4.716 | 6.066 | 7.804 |
| 5.03999999999989 | 4.727 | 6.081 | 7.824 |
| 5.04399999999989 | 4.737 | 6.096 | 7.844 |
| 5.04799999999989 | 4.747 | 6.111 | 7.865 |
| 5.051999999999888 | 4.758 | 6.125 | 7.886 |
| 5.055999999999888 | 4.769 | 6.14 | 7.906 |
| 5.059999999999887 | 4.779 | 6.155 | 7.927 |
| 5.063999999999887 | 4.79 | 6.17 | 7.948 |
| 5.067999999999887 | 4.8 | 6.185 | 7.969 |
| 5.071999999999886 | 4.811 | 6.2 | 7.99 |
| 5.075999999999885 | 4.822 | 6.215 | 8.01 |
| 5.079999999999885 | 4.833 | 6.23 | 8.032 |
| 5.083999999999885 | 4.843 | 6.245 | 8.053 |
| 5.087999999999884 | 4.854 | 6.26 | 8.074 |
| 5.091999999999884 | 4.865 | 6.276 | 8.095 |
| 5.095999999999884 | 4.876 | 6.291 | 8.116 |
| 5.099999999999883 | 4.887 | 6.306 | 8.138 |
| 5.103999999999883 | 4.898 | 6.321 | 8.159 |
| 5.107999999999882 | 4.909 | 6.337 | 8.181 |
| 5.111999999999882 | 4.92 | 6.352 | 8.202 |
| 5.115999999999882 | 4.931 | 6.368 | 8.224 |
| 5.119999999999881 | 4.942 | 6.383 | 8.246 |
| 5.123999999999881 | 4.953 | 6.399 | 8.267 |
| 5.12799999999988 | 4.964 | 6.415 | 8.289 |
| 5.13199999999988 | 4.975 | 6.43 | 8.311 |
| 5.13599999999988 | 4.986 | 6.446 | 8.333 |
| 5.139999999999878 | 4.997 | 6.462 | 8.355 |
| 5.143999999999878 | 5.009 | 6.478 | 8.377 |
| 5.147999999999878 | 5.02 | 6.493 | 8.4 |
| 5.151999999999877 | 5.031 | 6.509 | 8.422 |
| 5.155999999999877 | 5.042 | 6.525 | 8.444 |
| 5.159999999999876 | 5.054 | 6.541 | 8.467 |
| 5.163999999999876 | 5.065 | 6.557 | 8.489 |
| 5.167999999999876 | 5.077 | 6.573 | 8.512 |
| 5.171999999999875 | 5.088 | 6.59 | 8.534 |
| 5.175999999999874 | 5.099 | 6.606 | 8.557 |
| 5.179999999999874 | 5.111 | 6.622 | 8.58 |
| 5.183999999999874 | 5.123 | 6.638 | 8.602 |
| 5.187999999999874 | 5.134 | 6.655 | 8.625 |
| 5.191999999999873 | 5.146 | 6.671 | 8.648 |
| 5.195999999999873 | 5.157 | 6.687 | 8.671 |
| 5.199999999999872 | 5.169 | 6.704 | 8.694 |
| 5.203999999999871 | 5.181 | 6.72 | 8.718 |
| 5.207999999999871 | 5.192 | 6.737 | 8.741 |
| 5.21199999999987 | 5.204 | 6.754 | 8.764 |
| 5.21599999999987 | 5.216 | 6.77 | 8.788 |
| 5.21999999999987 | 5.228 | 6.787 | 8.811 |
| 5.22399999999987 | 5.24 | 6.804 | 8.835 |
| 5.22799999999987 | 5.252 | 6.821 | 8.858 |
| 5.231999999999868 | 5.264 | 6.837 | 8.882 |
| 5.235999999999868 | 5.276 | 6.854 | 8.906 |
| 5.239999999999867 | 5.288 | 6.871 | 8.929 |
| 5.243999999999867 | 5.3 | 6.888 | 8.953 |
| 5.247999999999866 | 5.312 | 6.905 | 8.977 |
| 5.251999999999866 | 5.324 | 6.923 | 9.001 |
| 5.255999999999866 | 5.336 | 6.94 | 9.026 |
| 5.259999999999865 | 5.348 | 6.957 | 9.05 |
| 5.263999999999865 | 5.36 | 6.974 | 9.074 |
| 5.267999999999864 | 5.373 | 6.992 | 9.098 |
| 5.271999999999864 | 5.385 | 7.009 | 9.123 |
| 5.275999999999863 | 5.397 | 7.026 | 9.147 |
| 5.279999999999863 | 5.409 | 7.044 | 9.172 |
| 5.283999999999863 | 5.422 | 7.061 | 9.197 |
| 5.287999999999862 | 5.434 | 7.079 | 9.221 |
| 5.291999999999862 | 5.447 | 7.097 | 9.246 |
| 5.295999999999861 | 5.459 | 7.114 | 9.271 |
| 5.29999999999986 | 5.472 | 7.132 | 9.296 |
| 5.30399999999986 | 5.484 | 7.15 | 9.321 |
| 5.30799999999986 | 5.497 | 7.168 | 9.346 |
| 5.31199999999986 | 5.509 | 7.185 | 9.371 |
| 5.315999999999859 | 5.522 | 7.203 | 9.397 |
| 5.31999999999986 | 5.535 | 7.221 | 9.422 |
| 5.323999999999859 | 5.548 | 7.239 | 9.448 |
| 5.327999999999858 | 5.56 | 7.258 | 9.473 |
| 5.331999999999857 | 5.573 | 7.276 | 9.499 |
| 5.335999999999857 | 5.586 | 7.294 | 9.524 |
| 5.339999999999856 | 5.599 | 7.312 | 9.55 |
| 5.343999999999856 | 5.612 | 7.331 | 9.576 |
| 5.347999999999856 | 5.625 | 7.349 | 9.602 |
| 5.351999999999855 | 5.638 | 7.367 | 9.628 |
| 5.355999999999855 | 5.651 | 7.386 | 9.654 |
| 5.359999999999854 | 5.664 | 7.404 | 9.68 |
| 5.363999999999854 | 5.677 | 7.423 | 9.706 |
| 5.367999999999854 | 5.69 | 7.442 | 9.733 |
| 5.371999999999853 | 5.703 | 7.46 | 9.759 |
| 5.375999999999853 | 5.716 | 7.479 | 9.786 |
| 5.379999999999852 | 5.729 | 7.498 | 9.812 |
| 5.383999999999852 | 5.743 | 7.517 | 9.839 |
| 5.387999999999852 | 5.756 | 7.536 | 9.866 |
| 5.391999999999851 | 5.769 | 7.555 | 9.892 |
| 5.395999999999851 | 5.783 | 7.574 | 9.919 |
| 5.39999999999985 | 5.796 | 7.593 | 9.946 |
| 5.40399999999985 | 5.81 | 7.612 | 9.973 |
| 5.40799999999985 | 5.823 | 7.631 | 10.001 |
| 5.411999999999848 | 5.837 | 7.65 | 10.028 |
| 5.415999999999848 | 5.85 | 7.67 | 10.055 |
| 5.419999999999848 | 5.864 | 7.689 | 10.083 |
| 5.423999999999847 | 5.878 | 7.709 | 10.11 |
| 5.427999999999847 | 5.891 | 7.728 | 10.138 |
| 5.431999999999846 | 5.905 | 7.748 | 10.165 |
| 5.435999999999846 | 5.919 | 7.767 | 10.193 |
| 5.439999999999845 | 5.932 | 7.787 | 10.221 |
| 5.443999999999845 | 5.946 | 7.807 | 10.249 |
| 5.447999999999844 | 5.96 | 7.826 | 10.277 |
| 5.451999999999844 | 5.974 | 7.846 | 10.305 |
| 5.455999999999844 | 5.988 | 7.866 | 10.333 |
| 5.459999999999843 | 6.002 | 7.886 | 10.362 |
| 5.463999999999843 | 6.016 | 7.906 | 10.39 |
| 5.467999999999843 | 6.03 | 7.926 | 10.418 |
| 5.471999999999842 | 6.044 | 7.946 | 10.447 |
| 5.475999999999841 | 6.058 | 7.967 | 10.476 |
| 5.47999999999984 | 6.073 | 7.987 | 10.504 |
| 5.48399999999984 | 6.087 | 8.007 | 10.533 |
| 5.48799999999984 | 6.101 | 8.027 | 10.562 |
| 5.49199999999984 | 6.115 | 8.048 | 10.591 |
| 5.49599999999984 | 6.13 | 8.068 | 10.62 |
| 5.49999999999984 | 6.144 | 8.089 | 10.649 |
| 5.503999999999838 | 6.159 | 8.11 | 10.679 |
| 5.507999999999838 | 6.173 | 8.13 | 10.708 |
| 5.511999999999837 | 6.188 | 8.151 | 10.738 |
| 5.515999999999837 | 6.202 | 8.172 | 10.767 |
| 5.519999999999837 | 6.217 | 8.193 | 10.797 |
| 5.523999999999836 | 6.231 | 8.214 | 10.826 |
| 5.527999999999836 | 6.246 | 8.235 | 10.856 |
| 5.531999999999835 | 6.261 | 8.256 | 10.886 |
| 5.535999999999835 | 6.276 | 8.277 | 10.916 |
| 5.539999999999834 | 6.29 | 8.298 | 10.946 |
| 5.543999999999834 | 6.305 | 8.319 | 10.977 |
| 5.547999999999834 | 6.32 | 8.341 | 11.007 |
| 5.551999999999833 | 6.335 | 8.362 | 11.037 |
| 5.555999999999833 | 6.35 | 8.383 | 11.068 |
| 5.559999999999832 | 6.365 | 8.405 | 11.098 |
| 5.563999999999832 | 6.38 | 8.426 | 11.129 |
| 5.567999999999832 | 6.395 | 8.448 | 11.16 |
| 5.57199999999983 | 6.41 | 8.47 | 11.191 |
| 5.57599999999983 | 6.425 | 8.491 | 11.222 |
| 5.57999999999983 | 6.441 | 8.513 | 11.253 |
| 5.58399999999983 | 6.456 | 8.535 | 11.284 |
| 5.58799999999983 | 6.471 | 8.557 | 11.315 |
| 5.59199999999983 | 6.487 | 8.579 | 11.347 |
| 5.595999999999828 | 6.502 | 8.601 | 11.378 |
| 5.599999999999828 | 6.517 | 8.623 | 11.41 |
| 5.603999999999827 | 6.533 | 8.645 | 11.441 |
| 5.607999999999827 | 6.548 | 8.668 | 11.473 |
| 5.611999999999826 | 6.564 | 8.69 | 11.505 |
| 5.615999999999826 | 6.58 | 8.713 | 11.537 |
| 5.619999999999825 | 6.595 | 8.735 | 11.569 |
| 5.623999999999825 | 6.611 | 8.758 | 11.601 |
| 5.627999999999825 | 6.627 | 8.78 | 11.634 |
| 5.631999999999824 | 6.642 | 8.803 | 11.666 |
| 5.635999999999824 | 6.658 | 8.826 | 11.698 |
| 5.639999999999823 | 6.674 | 8.848 | 11.731 |
| 5.643999999999823 | 6.69 | 8.871 | 11.764 |
| 5.647999999999823 | 6.706 | 8.894 | 11.796 |
| 5.651999999999822 | 6.722 | 8.917 | 11.829 |
| 5.655999999999822 | 6.738 | 8.94 | 11.862 |
| 5.659999999999821 | 6.754 | 8.963 | 11.895 |
| 5.663999999999821 | 6.77 | 8.987 | 11.929 |
| 5.667999999999821 | 6.786 | 9.01 | 11.962 |
| 5.67199999999982 | 6.803 | 9.033 | 11.995 |
| 5.67599999999982 | 6.819 | 9.057 | 12.029 |
| 5.67999999999982 | 6.835 | 9.08 | 12.062 |
| 5.683999999999819 | 6.852 | 9.104 | 12.096 |
| 5.687999999999818 | 6.868 | 9.127 | 12.13 |
| 5.691999999999818 | 6.885 | 9.151 | 12.164 |
| 5.695999999999818 | 6.901 | 9.175 | 12.198 |
| 5.699999999999817 | 6.918 | 9.199 | 12.232 |
| 5.703999999999816 | 6.934 | 9.223 | 12.266 |
| 5.707999999999816 | 6.951 | 9.247 | 12.301 |
| 5.711999999999815 | 6.968 | 9.271 | 12.335 |
| 5.715999999999815 | 6.984 | 9.295 | 12.37 |
| 5.719999999999814 | 7.001 | 9.319 | 12.405 |
| 5.723999999999814 | 7.018 | 9.343 | 12.439 |
| 5.727999999999814 | 7.035 | 9.368 | 12.474 |
| 5.731999999999813 | 7.052 | 9.392 | 12.509 |
| 5.735999999999813 | 7.069 | 9.417 | 12.544 |
| 5.739999999999812 | 7.086 | 9.441 | 12.58 |
| 5.743999999999812 | 7.103 | 9.466 | 12.615 |
| 5.747999999999812 | 7.12 | 9.491 | 12.65 |
| 5.751999999999811 | 7.137 | 9.515 | 12.686 |
| 5.755999999999811 | 7.154 | 9.54 | 12.722 |
| 5.75999999999981 | 7.172 | 9.565 | 12.758 |
| 5.76399999999981 | 7.189 | 9.59 | 12.793 |
| 5.76799999999981 | 7.206 | 9.615 | 12.83 |
| 5.77199999999981 | 7.224 | 9.64 | 12.866 |
| 5.775999999999808 | 7.241 | 9.666 | 12.902 |
| 5.779999999999808 | 7.259 | 9.691 | 12.938 |
| 5.783999999999807 | 7.276 | 9.716 | 12.975 |
| 5.787999999999807 | 7.294 | 9.742 | 13.011 |
| 5.791999999999806 | 7.311 | 9.767 | 13.048 |
| 5.795999999999806 | 7.329 | 9.793 | 13.085 |
| 5.799999999999806 | 7.347 | 9.819 | 13.122 |
| 5.803999999999805 | 7.365 | 9.844 | 13.159 |
| 5.807999999999805 | 7.383 | 9.87 | 13.196 |
| 5.811999999999804 | 7.401 | 9.896 | 13.233 |
| 5.815999999999804 | 7.418 | 9.922 | 13.271 |
| 5.819999999999804 | 7.436 | 9.948 | 13.308 |
| 5.823999999999804 | 7.455 | 9.974 | 13.346 |
| 5.827999999999803 | 7.473 | 10.001 | 13.384 |
| 5.831999999999802 | 7.491 | 10.027 | 13.422 |
| 5.835999999999802 | 7.509 | 10.053 | 13.46 |
| 5.839999999999801 | 7.527 | 10.08 | 13.498 |
| 5.843999999999801 | 7.546 | 10.106 | 13.536 |
| 5.847999999999801 | 7.564 | 10.133 | 13.575 |
| 5.8519999999998 | 7.582 | 10.16 | 13.613 |
| 5.8559999999998 | 7.601 | 10.187 | 13.652 |
| 5.8599999999998 | 7.619 | 10.213 | 13.69 |
| 5.863999999999799 | 7.638 | 10.24 | 13.729 |
| 5.867999999999799 | 7.657 | 10.267 | 13.768 |
| 5.871999999999798 | 7.675 | 10.294 | 13.807 |
| 5.875999999999798 | 7.694 | 10.322 | 13.847 |
| 5.879999999999797 | 7.713 | 10.349 | 13.886 |
| 5.883999999999797 | 7.732 | 10.376 | 13.926 |
| 5.887999999999796 | 7.751 | 10.404 | 13.965 |
| 5.891999999999796 | 7.77 | 10.431 | 14.005 |
| 5.895999999999796 | 7.789 | 10.459 | 14.045 |
| 5.899999999999795 | 7.808 | 10.487 | 14.085 |
| 5.903999999999794 | 7.827 | 10.514 | 14.125 |
| 5.907999999999794 | 7.846 | 10.542 | 14.165 |
| 5.911999999999794 | 7.865 | 10.57 | 14.206 |
| 5.915999999999793 | 7.884 | 10.598 | 14.246 |
| 5.919999999999793 | 7.904 | 10.626 | 14.287 |
| 5.923999999999793 | 7.923 | 10.654 | 14.327 |
| 5.927999999999792 | 7.942 | 10.683 | 14.368 |
| 5.931999999999791 | 7.962 | 10.711 | 14.409 |
| 5.935999999999791 | 7.982 | 10.74 | 14.45 |
| 5.93999999999979 | 8.001 | 10.768 | 14.492 |
| 5.94399999999979 | 8.021 | 10.797 | 14.533 |
| 5.94799999999979 | 8.04 | 10.825 | 14.575 |
| 5.95199999999979 | 8.06 | 10.854 | 14.616 |
| 5.955999999999789 | 8.08 | 10.883 | 14.658 |
| 5.959999999999788 | 8.1 | 10.912 | 14.7 |
| 5.963999999999788 | 8.12 | 10.941 | 14.742 |
| 5.967999999999788 | 8.14 | 10.97 | 14.784 |
| 5.971999999999787 | 8.16 | 10.999 | 14.827 |
| 5.975999999999786 | 8.18 | 11.029 | 14.869 |
| 5.979999999999786 | 8.2 | 11.058 | 14.912 |
| 5.983999999999785 | 8.22 | 11.088 | 14.955 |
| 5.987999999999785 | 8.241 | 11.117 | 14.998 |
| 5.991999999999785 | 8.261 | 11.147 | 15.041 |
| 5.995999999999784 | 8.281 | 11.177 | 15.084 |
| 5.999999999999784 | 8.302 | 11.206 | 15.127 |